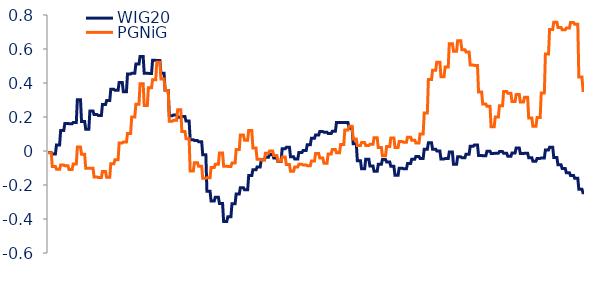
| Category | WIG20 | PGNiG |
|---|---|---|
| 2005-09-23 | -0.009 | -0.01 |
| 2005-09-26 | -0.009 | -0.01 |
| 2005-09-27 | -0.009 | -0.01 |
| 2005-09-28 | -0.009 | -0.01 |
| 2005-09-29 | -0.009 | -0.01 |
| 2005-09-30 | -0.009 | -0.01 |
| 2005-10-03 | -0.009 | -0.01 |
| 2005-10-04 | -0.009 | -0.01 |
| 2005-10-05 | -0.009 | -0.01 |
| 2005-10-06 | -0.009 | -0.01 |
| 2005-10-07 | -0.009 | -0.01 |
| 2005-10-10 | -0.009 | -0.01 |
| 2005-10-11 | -0.009 | -0.01 |
| 2005-10-12 | -0.009 | -0.01 |
| 2005-10-13 | -0.009 | -0.01 |
| 2005-10-14 | -0.009 | -0.01 |
| 2005-10-17 | -0.009 | -0.01 |
| 2005-10-18 | -0.009 | -0.01 |
| 2005-10-19 | -0.009 | -0.01 |
| 2005-10-20 | -0.009 | -0.01 |
| 2005-10-21 | -0.018 | -0.091 |
| 2005-10-24 | -0.018 | -0.091 |
| 2005-10-25 | -0.018 | -0.091 |
| 2005-10-26 | -0.018 | -0.091 |
| 2005-10-27 | -0.018 | -0.091 |
| 2005-10-28 | -0.018 | -0.091 |
| 2005-10-31 | -0.018 | -0.091 |
| 2005-11-02 | -0.018 | -0.091 |
| 2005-11-03 | -0.018 | -0.091 |
| 2005-11-04 | -0.018 | -0.091 |
| 2005-11-07 | -0.018 | -0.091 |
| 2005-11-08 | -0.018 | -0.091 |
| 2005-11-09 | -0.018 | -0.091 |
| 2005-11-10 | -0.018 | -0.091 |
| 2005-11-14 | -0.018 | -0.091 |
| 2005-11-15 | -0.018 | -0.091 |
| 2005-11-16 | -0.018 | -0.091 |
| 2005-11-17 | -0.018 | -0.091 |
| 2005-11-18 | -0.018 | -0.091 |
| 2005-11-21 | -0.018 | -0.091 |
| 2005-11-22 | 0.035 | -0.108 |
| 2005-11-23 | 0.035 | -0.108 |
| 2005-11-24 | 0.035 | -0.108 |
| 2005-11-25 | 0.035 | -0.108 |
| 2005-11-28 | 0.035 | -0.108 |
| 2005-11-29 | 0.035 | -0.108 |
| 2005-11-30 | 0.035 | -0.108 |
| 2005-12-01 | 0.035 | -0.108 |
| 2005-12-02 | 0.035 | -0.108 |
| 2005-12-05 | 0.035 | -0.108 |
| 2005-12-06 | 0.035 | -0.108 |
| 2005-12-07 | 0.035 | -0.108 |
| 2005-12-08 | 0.035 | -0.108 |
| 2005-12-09 | 0.035 | -0.108 |
| 2005-12-12 | 0.035 | -0.108 |
| 2005-12-13 | 0.035 | -0.108 |
| 2005-12-14 | 0.035 | -0.108 |
| 2005-12-15 | 0.035 | -0.108 |
| 2005-12-16 | 0.035 | -0.108 |
| 2005-12-19 | 0.035 | -0.108 |
| 2005-12-20 | 0.12 | -0.082 |
| 2005-12-21 | 0.12 | -0.082 |
| 2005-12-22 | 0.12 | -0.082 |
| 2005-12-23 | 0.12 | -0.082 |
| 2005-12-27 | 0.12 | -0.082 |
| 2005-12-28 | 0.12 | -0.082 |
| 2005-12-29 | 0.12 | -0.082 |
| 2005-12-30 | 0.12 | -0.082 |
| 2006-01-02 | 0.12 | -0.082 |
| 2006-01-03 | 0.12 | -0.082 |
| 2006-01-04 | 0.12 | -0.082 |
| 2006-01-05 | 0.12 | -0.082 |
| 2006-01-06 | 0.12 | -0.082 |
| 2006-01-09 | 0.12 | -0.082 |
| 2006-01-10 | 0.12 | -0.082 |
| 2006-01-11 | 0.12 | -0.082 |
| 2006-01-12 | 0.12 | -0.082 |
| 2006-01-13 | 0.12 | -0.082 |
| 2006-01-16 | 0.12 | -0.082 |
| 2006-01-17 | 0.12 | -0.082 |
| 2006-01-18 | 0.162 | -0.087 |
| 2006-01-19 | 0.162 | -0.087 |
| 2006-01-20 | 0.162 | -0.087 |
| 2006-01-23 | 0.162 | -0.087 |
| 2006-01-24 | 0.162 | -0.087 |
| 2006-01-25 | 0.162 | -0.087 |
| 2006-01-26 | 0.162 | -0.087 |
| 2006-01-27 | 0.162 | -0.087 |
| 2006-01-30 | 0.162 | -0.087 |
| 2006-01-31 | 0.162 | -0.087 |
| 2006-02-01 | 0.162 | -0.087 |
| 2006-02-02 | 0.162 | -0.087 |
| 2006-02-03 | 0.162 | -0.087 |
| 2006-02-06 | 0.162 | -0.087 |
| 2006-02-07 | 0.162 | -0.087 |
| 2006-02-08 | 0.162 | -0.087 |
| 2006-02-09 | 0.162 | -0.087 |
| 2006-02-10 | 0.162 | -0.087 |
| 2006-02-13 | 0.162 | -0.087 |
| 2006-02-14 | 0.162 | -0.087 |
| 2006-02-15 | 0.16 | -0.109 |
| 2006-02-16 | 0.16 | -0.109 |
| 2006-02-17 | 0.16 | -0.109 |
| 2006-02-20 | 0.16 | -0.109 |
| 2006-02-21 | 0.16 | -0.109 |
| 2006-02-22 | 0.16 | -0.109 |
| 2006-02-23 | 0.16 | -0.109 |
| 2006-02-24 | 0.16 | -0.109 |
| 2006-02-27 | 0.16 | -0.109 |
| 2006-02-28 | 0.16 | -0.109 |
| 2006-03-01 | 0.16 | -0.109 |
| 2006-03-02 | 0.16 | -0.109 |
| 2006-03-03 | 0.16 | -0.109 |
| 2006-03-06 | 0.16 | -0.109 |
| 2006-03-07 | 0.16 | -0.109 |
| 2006-03-08 | 0.16 | -0.109 |
| 2006-03-09 | 0.16 | -0.109 |
| 2006-03-10 | 0.16 | -0.109 |
| 2006-03-13 | 0.16 | -0.109 |
| 2006-03-14 | 0.16 | -0.109 |
| 2006-03-15 | 0.168 | -0.077 |
| 2006-03-16 | 0.168 | -0.077 |
| 2006-03-17 | 0.168 | -0.077 |
| 2006-03-20 | 0.168 | -0.077 |
| 2006-03-21 | 0.168 | -0.077 |
| 2006-03-22 | 0.168 | -0.077 |
| 2006-03-23 | 0.168 | -0.077 |
| 2006-03-24 | 0.168 | -0.077 |
| 2006-03-27 | 0.168 | -0.077 |
| 2006-03-28 | 0.168 | -0.077 |
| 2006-03-29 | 0.168 | -0.077 |
| 2006-03-30 | 0.168 | -0.077 |
| 2006-03-31 | 0.168 | -0.077 |
| 2006-04-03 | 0.168 | -0.077 |
| 2006-04-04 | 0.168 | -0.077 |
| 2006-04-05 | 0.168 | -0.077 |
| 2006-04-06 | 0.168 | -0.077 |
| 2006-04-07 | 0.168 | -0.077 |
| 2006-04-10 | 0.168 | -0.077 |
| 2006-04-11 | 0.168 | -0.077 |
| 2006-04-12 | 0.302 | 0.023 |
| 2006-04-13 | 0.302 | 0.023 |
| 2006-04-18 | 0.302 | 0.023 |
| 2006-04-19 | 0.302 | 0.023 |
| 2006-04-20 | 0.302 | 0.023 |
| 2006-04-21 | 0.302 | 0.023 |
| 2006-04-24 | 0.302 | 0.023 |
| 2006-04-25 | 0.302 | 0.023 |
| 2006-04-26 | 0.302 | 0.023 |
| 2006-04-27 | 0.302 | 0.023 |
| 2006-04-28 | 0.302 | 0.023 |
| 2006-05-02 | 0.302 | 0.023 |
| 2006-05-04 | 0.302 | 0.023 |
| 2006-05-05 | 0.302 | 0.023 |
| 2006-05-08 | 0.302 | 0.023 |
| 2006-05-09 | 0.302 | 0.023 |
| 2006-05-10 | 0.302 | 0.023 |
| 2006-05-11 | 0.302 | 0.023 |
| 2006-05-12 | 0.302 | 0.023 |
| 2006-05-15 | 0.302 | 0.023 |
| 2006-05-16 | 0.174 | -0.019 |
| 2006-05-17 | 0.174 | -0.019 |
| 2006-05-18 | 0.174 | -0.019 |
| 2006-05-19 | 0.174 | -0.019 |
| 2006-05-22 | 0.174 | -0.019 |
| 2006-05-23 | 0.174 | -0.019 |
| 2006-05-24 | 0.174 | -0.019 |
| 2006-05-25 | 0.174 | -0.019 |
| 2006-05-26 | 0.174 | -0.019 |
| 2006-05-29 | 0.174 | -0.019 |
| 2006-05-30 | 0.174 | -0.019 |
| 2006-05-31 | 0.174 | -0.019 |
| 2006-06-01 | 0.174 | -0.019 |
| 2006-06-02 | 0.174 | -0.019 |
| 2006-06-05 | 0.174 | -0.019 |
| 2006-06-06 | 0.174 | -0.019 |
| 2006-06-07 | 0.174 | -0.019 |
| 2006-06-08 | 0.174 | -0.019 |
| 2006-06-09 | 0.174 | -0.019 |
| 2006-06-12 | 0.174 | -0.019 |
| 2006-06-13 | 0.128 | -0.101 |
| 2006-06-14 | 0.128 | -0.101 |
| 2006-06-16 | 0.128 | -0.101 |
| 2006-06-19 | 0.128 | -0.101 |
| 2006-06-20 | 0.128 | -0.101 |
| 2006-06-21 | 0.128 | -0.101 |
| 2006-06-22 | 0.128 | -0.101 |
| 2006-06-23 | 0.128 | -0.101 |
| 2006-06-26 | 0.128 | -0.101 |
| 2006-06-27 | 0.128 | -0.101 |
| 2006-06-28 | 0.128 | -0.101 |
| 2006-06-29 | 0.128 | -0.101 |
| 2006-06-30 | 0.128 | -0.101 |
| 2006-07-03 | 0.128 | -0.101 |
| 2006-07-04 | 0.128 | -0.101 |
| 2006-07-05 | 0.128 | -0.101 |
| 2006-07-06 | 0.128 | -0.101 |
| 2006-07-07 | 0.128 | -0.101 |
| 2006-07-10 | 0.128 | -0.101 |
| 2006-07-11 | 0.128 | -0.101 |
| 2006-07-12 | 0.236 | -0.101 |
| 2006-07-13 | 0.236 | -0.101 |
| 2006-07-14 | 0.236 | -0.101 |
| 2006-07-17 | 0.236 | -0.101 |
| 2006-07-18 | 0.236 | -0.101 |
| 2006-07-19 | 0.236 | -0.101 |
| 2006-07-20 | 0.236 | -0.101 |
| 2006-07-21 | 0.236 | -0.101 |
| 2006-07-24 | 0.236 | -0.101 |
| 2006-07-25 | 0.236 | -0.101 |
| 2006-07-26 | 0.236 | -0.101 |
| 2006-07-27 | 0.236 | -0.101 |
| 2006-07-28 | 0.236 | -0.101 |
| 2006-07-31 | 0.236 | -0.101 |
| 2006-08-01 | 0.236 | -0.101 |
| 2006-08-02 | 0.236 | -0.101 |
| 2006-08-03 | 0.236 | -0.101 |
| 2006-08-04 | 0.236 | -0.101 |
| 2006-08-07 | 0.236 | -0.101 |
| 2006-08-08 | 0.236 | -0.101 |
| 2006-08-09 | 0.214 | -0.153 |
| 2006-08-10 | 0.214 | -0.153 |
| 2006-08-11 | 0.214 | -0.153 |
| 2006-08-14 | 0.214 | -0.153 |
| 2006-08-16 | 0.214 | -0.153 |
| 2006-08-17 | 0.214 | -0.153 |
| 2006-08-18 | 0.214 | -0.153 |
| 2006-08-21 | 0.214 | -0.153 |
| 2006-08-22 | 0.214 | -0.153 |
| 2006-08-23 | 0.214 | -0.153 |
| 2006-08-24 | 0.214 | -0.153 |
| 2006-08-25 | 0.214 | -0.153 |
| 2006-08-28 | 0.214 | -0.153 |
| 2006-08-29 | 0.214 | -0.153 |
| 2006-08-30 | 0.214 | -0.153 |
| 2006-08-31 | 0.214 | -0.153 |
| 2006-09-01 | 0.214 | -0.153 |
| 2006-09-04 | 0.214 | -0.153 |
| 2006-09-05 | 0.214 | -0.153 |
| 2006-09-06 | 0.214 | -0.153 |
| 2006-09-07 | 0.209 | -0.156 |
| 2006-09-08 | 0.209 | -0.156 |
| 2006-09-11 | 0.209 | -0.156 |
| 2006-09-12 | 0.209 | -0.156 |
| 2006-09-13 | 0.209 | -0.156 |
| 2006-09-14 | 0.209 | -0.156 |
| 2006-09-15 | 0.209 | -0.156 |
| 2006-09-18 | 0.209 | -0.156 |
| 2006-09-19 | 0.209 | -0.156 |
| 2006-09-20 | 0.209 | -0.156 |
| 2006-09-21 | 0.209 | -0.156 |
| 2006-09-22 | 0.209 | -0.156 |
| 2006-09-25 | 0.209 | -0.156 |
| 2006-09-26 | 0.209 | -0.156 |
| 2006-09-27 | 0.209 | -0.156 |
| 2006-09-28 | 0.209 | -0.156 |
| 2006-09-29 | 0.209 | -0.156 |
| 2006-10-02 | 0.209 | -0.156 |
| 2006-10-03 | 0.209 | -0.156 |
| 2006-10-04 | 0.209 | -0.156 |
| 2006-10-05 | 0.273 | -0.121 |
| 2006-10-06 | 0.273 | -0.121 |
| 2006-10-09 | 0.273 | -0.121 |
| 2006-10-10 | 0.273 | -0.121 |
| 2006-10-11 | 0.273 | -0.121 |
| 2006-10-12 | 0.273 | -0.121 |
| 2006-10-13 | 0.273 | -0.121 |
| 2006-10-16 | 0.273 | -0.121 |
| 2006-10-17 | 0.273 | -0.121 |
| 2006-10-18 | 0.273 | -0.121 |
| 2006-10-19 | 0.273 | -0.121 |
| 2006-10-20 | 0.273 | -0.121 |
| 2006-10-23 | 0.273 | -0.121 |
| 2006-10-24 | 0.273 | -0.121 |
| 2006-10-25 | 0.273 | -0.121 |
| 2006-10-26 | 0.273 | -0.121 |
| 2006-10-27 | 0.273 | -0.121 |
| 2006-10-30 | 0.273 | -0.121 |
| 2006-10-31 | 0.273 | -0.121 |
| 2006-11-02 | 0.273 | -0.121 |
| 2006-11-03 | 0.297 | -0.154 |
| 2006-11-06 | 0.297 | -0.154 |
| 2006-11-07 | 0.297 | -0.154 |
| 2006-11-08 | 0.297 | -0.154 |
| 2006-11-09 | 0.297 | -0.154 |
| 2006-11-10 | 0.297 | -0.154 |
| 2006-11-13 | 0.297 | -0.154 |
| 2006-11-14 | 0.297 | -0.154 |
| 2006-11-15 | 0.297 | -0.154 |
| 2006-11-16 | 0.297 | -0.154 |
| 2006-11-17 | 0.297 | -0.154 |
| 2006-11-20 | 0.297 | -0.154 |
| 2006-11-21 | 0.297 | -0.154 |
| 2006-11-22 | 0.297 | -0.154 |
| 2006-11-23 | 0.297 | -0.154 |
| 2006-11-24 | 0.297 | -0.154 |
| 2006-11-27 | 0.297 | -0.154 |
| 2006-11-28 | 0.297 | -0.154 |
| 2006-11-29 | 0.297 | -0.154 |
| 2006-11-30 | 0.297 | -0.154 |
| 2006-12-01 | 0.363 | -0.075 |
| 2006-12-04 | 0.363 | -0.075 |
| 2006-12-05 | 0.363 | -0.075 |
| 2006-12-06 | 0.363 | -0.075 |
| 2006-12-07 | 0.363 | -0.075 |
| 2006-12-08 | 0.363 | -0.075 |
| 2006-12-11 | 0.363 | -0.075 |
| 2006-12-12 | 0.363 | -0.075 |
| 2006-12-13 | 0.363 | -0.075 |
| 2006-12-14 | 0.363 | -0.075 |
| 2006-12-15 | 0.363 | -0.075 |
| 2006-12-18 | 0.363 | -0.075 |
| 2006-12-19 | 0.363 | -0.075 |
| 2006-12-20 | 0.363 | -0.075 |
| 2006-12-21 | 0.363 | -0.075 |
| 2006-12-22 | 0.363 | -0.075 |
| 2006-12-27 | 0.363 | -0.075 |
| 2006-12-28 | 0.363 | -0.075 |
| 2006-12-29 | 0.363 | -0.075 |
| 2007-01-02 | 0.363 | -0.075 |
| 2007-01-03 | 0.357 | -0.051 |
| 2007-01-04 | 0.357 | -0.051 |
| 2007-01-05 | 0.357 | -0.051 |
| 2007-01-08 | 0.357 | -0.051 |
| 2007-01-09 | 0.357 | -0.051 |
| 2007-01-10 | 0.357 | -0.051 |
| 2007-01-11 | 0.357 | -0.051 |
| 2007-01-12 | 0.357 | -0.051 |
| 2007-01-15 | 0.357 | -0.051 |
| 2007-01-16 | 0.357 | -0.051 |
| 2007-01-17 | 0.357 | -0.051 |
| 2007-01-18 | 0.357 | -0.051 |
| 2007-01-19 | 0.357 | -0.051 |
| 2007-01-22 | 0.357 | -0.051 |
| 2007-01-23 | 0.357 | -0.051 |
| 2007-01-24 | 0.357 | -0.051 |
| 2007-01-25 | 0.357 | -0.051 |
| 2007-01-26 | 0.357 | -0.051 |
| 2007-01-29 | 0.357 | -0.051 |
| 2007-01-30 | 0.357 | -0.051 |
| 2007-01-31 | 0.403 | 0.047 |
| 2007-02-01 | 0.403 | 0.047 |
| 2007-02-02 | 0.403 | 0.047 |
| 2007-02-05 | 0.403 | 0.047 |
| 2007-02-06 | 0.403 | 0.047 |
| 2007-02-07 | 0.403 | 0.047 |
| 2007-02-08 | 0.403 | 0.047 |
| 2007-02-09 | 0.403 | 0.047 |
| 2007-02-12 | 0.403 | 0.047 |
| 2007-02-13 | 0.403 | 0.047 |
| 2007-02-14 | 0.403 | 0.047 |
| 2007-02-15 | 0.403 | 0.047 |
| 2007-02-16 | 0.403 | 0.047 |
| 2007-02-19 | 0.403 | 0.047 |
| 2007-02-20 | 0.403 | 0.047 |
| 2007-02-21 | 0.403 | 0.047 |
| 2007-02-22 | 0.403 | 0.047 |
| 2007-02-23 | 0.403 | 0.047 |
| 2007-02-26 | 0.403 | 0.047 |
| 2007-02-27 | 0.403 | 0.047 |
| 2007-02-28 | 0.349 | 0.053 |
| 2007-03-01 | 0.349 | 0.053 |
| 2007-03-02 | 0.349 | 0.053 |
| 2007-03-05 | 0.349 | 0.053 |
| 2007-03-06 | 0.349 | 0.053 |
| 2007-03-07 | 0.349 | 0.053 |
| 2007-03-08 | 0.349 | 0.053 |
| 2007-03-09 | 0.349 | 0.053 |
| 2007-03-12 | 0.349 | 0.053 |
| 2007-03-13 | 0.349 | 0.053 |
| 2007-03-14 | 0.349 | 0.053 |
| 2007-03-15 | 0.349 | 0.053 |
| 2007-03-16 | 0.349 | 0.053 |
| 2007-03-19 | 0.349 | 0.053 |
| 2007-03-20 | 0.349 | 0.053 |
| 2007-03-21 | 0.349 | 0.053 |
| 2007-03-22 | 0.349 | 0.053 |
| 2007-03-23 | 0.349 | 0.053 |
| 2007-03-26 | 0.349 | 0.053 |
| 2007-03-27 | 0.349 | 0.053 |
| 2007-03-28 | 0.453 | 0.103 |
| 2007-03-29 | 0.453 | 0.103 |
| 2007-03-30 | 0.453 | 0.103 |
| 2007-04-02 | 0.453 | 0.103 |
| 2007-04-03 | 0.453 | 0.103 |
| 2007-04-04 | 0.453 | 0.103 |
| 2007-04-05 | 0.453 | 0.103 |
| 2007-04-10 | 0.453 | 0.103 |
| 2007-04-11 | 0.453 | 0.103 |
| 2007-04-12 | 0.453 | 0.103 |
| 2007-04-13 | 0.453 | 0.103 |
| 2007-04-16 | 0.453 | 0.103 |
| 2007-04-17 | 0.453 | 0.103 |
| 2007-04-18 | 0.453 | 0.103 |
| 2007-04-19 | 0.453 | 0.103 |
| 2007-04-20 | 0.453 | 0.103 |
| 2007-04-23 | 0.453 | 0.103 |
| 2007-04-24 | 0.453 | 0.103 |
| 2007-04-25 | 0.453 | 0.103 |
| 2007-04-26 | 0.453 | 0.103 |
| 2007-04-27 | 0.458 | 0.2 |
| 2007-04-30 | 0.458 | 0.2 |
| 2007-05-02 | 0.458 | 0.2 |
| 2007-05-04 | 0.458 | 0.2 |
| 2007-05-07 | 0.458 | 0.2 |
| 2007-05-08 | 0.458 | 0.2 |
| 2007-05-09 | 0.458 | 0.2 |
| 2007-05-10 | 0.458 | 0.2 |
| 2007-05-11 | 0.458 | 0.2 |
| 2007-05-14 | 0.458 | 0.2 |
| 2007-05-15 | 0.458 | 0.2 |
| 2007-05-16 | 0.458 | 0.2 |
| 2007-05-17 | 0.458 | 0.2 |
| 2007-05-18 | 0.458 | 0.2 |
| 2007-05-21 | 0.458 | 0.2 |
| 2007-05-22 | 0.458 | 0.2 |
| 2007-05-23 | 0.458 | 0.2 |
| 2007-05-24 | 0.458 | 0.2 |
| 2007-05-25 | 0.458 | 0.2 |
| 2007-05-28 | 0.458 | 0.2 |
| 2007-05-29 | 0.511 | 0.275 |
| 2007-05-30 | 0.511 | 0.275 |
| 2007-05-31 | 0.511 | 0.275 |
| 2007-06-01 | 0.511 | 0.275 |
| 2007-06-04 | 0.511 | 0.275 |
| 2007-06-05 | 0.511 | 0.275 |
| 2007-06-06 | 0.511 | 0.275 |
| 2007-06-08 | 0.511 | 0.275 |
| 2007-06-11 | 0.511 | 0.275 |
| 2007-06-12 | 0.511 | 0.275 |
| 2007-06-13 | 0.511 | 0.275 |
| 2007-06-14 | 0.511 | 0.275 |
| 2007-06-15 | 0.511 | 0.275 |
| 2007-06-18 | 0.511 | 0.275 |
| 2007-06-19 | 0.511 | 0.275 |
| 2007-06-20 | 0.511 | 0.275 |
| 2007-06-21 | 0.511 | 0.275 |
| 2007-06-22 | 0.511 | 0.275 |
| 2007-06-25 | 0.511 | 0.275 |
| 2007-06-26 | 0.511 | 0.275 |
| 2007-06-27 | 0.556 | 0.395 |
| 2007-06-28 | 0.556 | 0.395 |
| 2007-06-29 | 0.556 | 0.395 |
| 2007-07-02 | 0.556 | 0.395 |
| 2007-07-03 | 0.556 | 0.395 |
| 2007-07-04 | 0.556 | 0.395 |
| 2007-07-05 | 0.556 | 0.395 |
| 2007-07-06 | 0.556 | 0.395 |
| 2007-07-09 | 0.556 | 0.395 |
| 2007-07-10 | 0.556 | 0.395 |
| 2007-07-11 | 0.556 | 0.395 |
| 2007-07-12 | 0.556 | 0.395 |
| 2007-07-13 | 0.556 | 0.395 |
| 2007-07-16 | 0.556 | 0.395 |
| 2007-07-17 | 0.556 | 0.395 |
| 2007-07-18 | 0.556 | 0.395 |
| 2007-07-19 | 0.556 | 0.395 |
| 2007-07-20 | 0.556 | 0.395 |
| 2007-07-23 | 0.556 | 0.395 |
| 2007-07-24 | 0.556 | 0.395 |
| 2007-07-25 | 0.457 | 0.267 |
| 2007-07-26 | 0.457 | 0.267 |
| 2007-07-27 | 0.457 | 0.267 |
| 2007-07-30 | 0.457 | 0.267 |
| 2007-07-31 | 0.457 | 0.267 |
| 2007-08-01 | 0.457 | 0.267 |
| 2007-08-02 | 0.457 | 0.267 |
| 2007-08-03 | 0.457 | 0.267 |
| 2007-08-06 | 0.457 | 0.267 |
| 2007-08-07 | 0.457 | 0.267 |
| 2007-08-08 | 0.457 | 0.267 |
| 2007-08-09 | 0.457 | 0.267 |
| 2007-08-10 | 0.457 | 0.267 |
| 2007-08-13 | 0.457 | 0.267 |
| 2007-08-14 | 0.457 | 0.267 |
| 2007-08-16 | 0.457 | 0.267 |
| 2007-08-17 | 0.457 | 0.267 |
| 2007-08-20 | 0.457 | 0.267 |
| 2007-08-21 | 0.457 | 0.267 |
| 2007-08-22 | 0.457 | 0.267 |
| 2007-08-23 | 0.457 | 0.372 |
| 2007-08-24 | 0.457 | 0.372 |
| 2007-08-27 | 0.457 | 0.372 |
| 2007-08-28 | 0.457 | 0.372 |
| 2007-08-29 | 0.457 | 0.372 |
| 2007-08-30 | 0.457 | 0.372 |
| 2007-08-31 | 0.457 | 0.372 |
| 2007-09-03 | 0.457 | 0.372 |
| 2007-09-04 | 0.457 | 0.372 |
| 2007-09-05 | 0.457 | 0.372 |
| 2007-09-06 | 0.457 | 0.372 |
| 2007-09-07 | 0.457 | 0.372 |
| 2007-09-10 | 0.457 | 0.372 |
| 2007-09-11 | 0.457 | 0.372 |
| 2007-09-12 | 0.457 | 0.372 |
| 2007-09-13 | 0.457 | 0.372 |
| 2007-09-14 | 0.457 | 0.372 |
| 2007-09-17 | 0.457 | 0.372 |
| 2007-09-18 | 0.457 | 0.372 |
| 2007-09-19 | 0.457 | 0.372 |
| 2007-09-20 | 0.534 | 0.419 |
| 2007-09-21 | 0.534 | 0.419 |
| 2007-09-24 | 0.534 | 0.419 |
| 2007-09-25 | 0.534 | 0.419 |
| 2007-09-26 | 0.534 | 0.419 |
| 2007-09-27 | 0.534 | 0.419 |
| 2007-09-28 | 0.534 | 0.419 |
| 2007-10-01 | 0.534 | 0.419 |
| 2007-10-02 | 0.534 | 0.419 |
| 2007-10-03 | 0.534 | 0.419 |
| 2007-10-04 | 0.534 | 0.419 |
| 2007-10-05 | 0.534 | 0.419 |
| 2007-10-08 | 0.534 | 0.419 |
| 2007-10-09 | 0.534 | 0.419 |
| 2007-10-10 | 0.534 | 0.419 |
| 2007-10-11 | 0.534 | 0.419 |
| 2007-10-12 | 0.534 | 0.419 |
| 2007-10-15 | 0.534 | 0.419 |
| 2007-10-16 | 0.534 | 0.419 |
| 2007-10-17 | 0.534 | 0.419 |
| 2007-10-18 | 0.532 | 0.521 |
| 2007-10-19 | 0.532 | 0.521 |
| 2007-10-22 | 0.532 | 0.521 |
| 2007-10-23 | 0.532 | 0.521 |
| 2007-10-24 | 0.532 | 0.521 |
| 2007-10-25 | 0.532 | 0.521 |
| 2007-10-26 | 0.532 | 0.521 |
| 2007-10-29 | 0.532 | 0.521 |
| 2007-10-30 | 0.532 | 0.521 |
| 2007-10-31 | 0.532 | 0.521 |
| 2007-11-02 | 0.532 | 0.521 |
| 2007-11-05 | 0.532 | 0.521 |
| 2007-11-06 | 0.532 | 0.521 |
| 2007-11-07 | 0.532 | 0.521 |
| 2007-11-08 | 0.532 | 0.521 |
| 2007-11-09 | 0.532 | 0.521 |
| 2007-11-12 | 0.532 | 0.521 |
| 2007-11-13 | 0.532 | 0.521 |
| 2007-11-14 | 0.532 | 0.521 |
| 2007-11-15 | 0.532 | 0.521 |
| 2007-11-16 | 0.457 | 0.424 |
| 2007-11-19 | 0.457 | 0.424 |
| 2007-11-20 | 0.457 | 0.424 |
| 2007-11-21 | 0.457 | 0.424 |
| 2007-11-22 | 0.457 | 0.424 |
| 2007-11-23 | 0.457 | 0.424 |
| 2007-11-26 | 0.457 | 0.424 |
| 2007-11-27 | 0.457 | 0.424 |
| 2007-11-28 | 0.457 | 0.424 |
| 2007-11-29 | 0.457 | 0.424 |
| 2007-11-30 | 0.457 | 0.424 |
| 2007-12-03 | 0.457 | 0.424 |
| 2007-12-04 | 0.457 | 0.424 |
| 2007-12-05 | 0.457 | 0.424 |
| 2007-12-06 | 0.457 | 0.424 |
| 2007-12-07 | 0.457 | 0.424 |
| 2007-12-10 | 0.457 | 0.424 |
| 2007-12-11 | 0.457 | 0.424 |
| 2007-12-12 | 0.457 | 0.424 |
| 2007-12-13 | 0.457 | 0.424 |
| 2007-12-14 | 0.357 | 0.355 |
| 2007-12-17 | 0.357 | 0.355 |
| 2007-12-18 | 0.357 | 0.355 |
| 2007-12-19 | 0.357 | 0.355 |
| 2007-12-20 | 0.357 | 0.355 |
| 2007-12-21 | 0.357 | 0.355 |
| 2007-12-27 | 0.357 | 0.355 |
| 2007-12-28 | 0.357 | 0.355 |
| 2008-01-02 | 0.357 | 0.355 |
| 2008-01-03 | 0.357 | 0.355 |
| 2008-01-04 | 0.357 | 0.355 |
| 2008-01-07 | 0.357 | 0.355 |
| 2008-01-08 | 0.357 | 0.355 |
| 2008-01-09 | 0.357 | 0.355 |
| 2008-01-10 | 0.357 | 0.355 |
| 2008-01-11 | 0.357 | 0.355 |
| 2008-01-14 | 0.357 | 0.355 |
| 2008-01-15 | 0.357 | 0.355 |
| 2008-01-16 | 0.357 | 0.355 |
| 2008-01-17 | 0.357 | 0.355 |
| 2008-01-18 | 0.208 | 0.175 |
| 2008-01-21 | 0.208 | 0.175 |
| 2008-01-22 | 0.208 | 0.175 |
| 2008-01-23 | 0.208 | 0.175 |
| 2008-01-24 | 0.208 | 0.175 |
| 2008-01-25 | 0.208 | 0.175 |
| 2008-01-28 | 0.208 | 0.175 |
| 2008-01-29 | 0.208 | 0.175 |
| 2008-01-30 | 0.208 | 0.175 |
| 2008-01-31 | 0.208 | 0.175 |
| 2008-02-01 | 0.208 | 0.175 |
| 2008-02-04 | 0.208 | 0.175 |
| 2008-02-05 | 0.208 | 0.175 |
| 2008-02-06 | 0.208 | 0.175 |
| 2008-02-07 | 0.208 | 0.175 |
| 2008-02-08 | 0.208 | 0.175 |
| 2008-02-11 | 0.208 | 0.175 |
| 2008-02-12 | 0.208 | 0.175 |
| 2008-02-13 | 0.208 | 0.175 |
| 2008-02-14 | 0.208 | 0.175 |
| 2008-02-15 | 0.212 | 0.181 |
| 2008-02-18 | 0.212 | 0.181 |
| 2008-02-19 | 0.212 | 0.181 |
| 2008-02-20 | 0.212 | 0.181 |
| 2008-02-21 | 0.212 | 0.181 |
| 2008-02-22 | 0.212 | 0.181 |
| 2008-02-25 | 0.212 | 0.181 |
| 2008-02-26 | 0.212 | 0.181 |
| 2008-02-27 | 0.212 | 0.181 |
| 2008-02-28 | 0.212 | 0.181 |
| 2008-02-29 | 0.212 | 0.181 |
| 2008-03-03 | 0.212 | 0.181 |
| 2008-03-04 | 0.212 | 0.181 |
| 2008-03-05 | 0.212 | 0.181 |
| 2008-03-06 | 0.212 | 0.181 |
| 2008-03-07 | 0.212 | 0.181 |
| 2008-03-10 | 0.212 | 0.181 |
| 2008-03-11 | 0.212 | 0.181 |
| 2008-03-12 | 0.212 | 0.181 |
| 2008-03-13 | 0.212 | 0.181 |
| 2008-03-14 | 0.198 | 0.242 |
| 2008-03-17 | 0.198 | 0.242 |
| 2008-03-18 | 0.198 | 0.242 |
| 2008-03-19 | 0.198 | 0.242 |
| 2008-03-20 | 0.198 | 0.242 |
| 2008-03-25 | 0.198 | 0.242 |
| 2008-03-26 | 0.198 | 0.242 |
| 2008-03-27 | 0.198 | 0.242 |
| 2008-03-28 | 0.198 | 0.242 |
| 2008-03-31 | 0.198 | 0.242 |
| 2008-04-01 | 0.198 | 0.242 |
| 2008-04-02 | 0.198 | 0.242 |
| 2008-04-03 | 0.198 | 0.242 |
| 2008-04-04 | 0.198 | 0.242 |
| 2008-04-07 | 0.198 | 0.242 |
| 2008-04-08 | 0.198 | 0.242 |
| 2008-04-09 | 0.198 | 0.242 |
| 2008-04-10 | 0.198 | 0.242 |
| 2008-04-11 | 0.198 | 0.242 |
| 2008-04-14 | 0.198 | 0.242 |
| 2008-04-15 | 0.202 | 0.115 |
| 2008-04-16 | 0.202 | 0.115 |
| 2008-04-17 | 0.202 | 0.115 |
| 2008-04-18 | 0.202 | 0.115 |
| 2008-04-21 | 0.202 | 0.115 |
| 2008-04-22 | 0.202 | 0.115 |
| 2008-04-23 | 0.202 | 0.115 |
| 2008-04-24 | 0.202 | 0.115 |
| 2008-04-25 | 0.202 | 0.115 |
| 2008-04-28 | 0.202 | 0.115 |
| 2008-04-29 | 0.202 | 0.115 |
| 2008-04-30 | 0.202 | 0.115 |
| 2008-05-05 | 0.202 | 0.115 |
| 2008-05-06 | 0.202 | 0.115 |
| 2008-05-07 | 0.202 | 0.115 |
| 2008-05-08 | 0.202 | 0.115 |
| 2008-05-09 | 0.202 | 0.115 |
| 2008-05-12 | 0.202 | 0.115 |
| 2008-05-13 | 0.202 | 0.115 |
| 2008-05-14 | 0.202 | 0.115 |
| 2008-05-15 | 0.176 | 0.073 |
| 2008-05-16 | 0.176 | 0.073 |
| 2008-05-19 | 0.176 | 0.073 |
| 2008-05-20 | 0.176 | 0.073 |
| 2008-05-21 | 0.176 | 0.073 |
| 2008-05-23 | 0.176 | 0.073 |
| 2008-05-26 | 0.176 | 0.073 |
| 2008-05-27 | 0.176 | 0.073 |
| 2008-05-28 | 0.176 | 0.073 |
| 2008-05-29 | 0.176 | 0.073 |
| 2008-05-30 | 0.176 | 0.073 |
| 2008-06-02 | 0.176 | 0.073 |
| 2008-06-03 | 0.176 | 0.073 |
| 2008-06-04 | 0.176 | 0.073 |
| 2008-06-05 | 0.176 | 0.073 |
| 2008-06-06 | 0.176 | 0.073 |
| 2008-06-09 | 0.176 | 0.073 |
| 2008-06-10 | 0.176 | 0.073 |
| 2008-06-11 | 0.176 | 0.073 |
| 2008-06-12 | 0.176 | 0.073 |
| 2008-06-13 | 0.067 | -0.118 |
| 2008-06-16 | 0.067 | -0.118 |
| 2008-06-17 | 0.067 | -0.118 |
| 2008-06-18 | 0.067 | -0.118 |
| 2008-06-19 | 0.067 | -0.118 |
| 2008-06-20 | 0.067 | -0.118 |
| 2008-06-23 | 0.067 | -0.118 |
| 2008-06-24 | 0.067 | -0.118 |
| 2008-06-25 | 0.067 | -0.118 |
| 2008-06-26 | 0.067 | -0.118 |
| 2008-06-27 | 0.067 | -0.118 |
| 2008-06-30 | 0.067 | -0.118 |
| 2008-07-01 | 0.067 | -0.118 |
| 2008-07-02 | 0.067 | -0.118 |
| 2008-07-03 | 0.067 | -0.118 |
| 2008-07-04 | 0.067 | -0.118 |
| 2008-07-07 | 0.067 | -0.118 |
| 2008-07-08 | 0.067 | -0.118 |
| 2008-07-09 | 0.067 | -0.118 |
| 2008-07-10 | 0.067 | -0.118 |
| 2008-07-11 | 0.062 | -0.069 |
| 2008-07-14 | 0.062 | -0.069 |
| 2008-07-15 | 0.062 | -0.069 |
| 2008-07-16 | 0.062 | -0.069 |
| 2008-07-17 | 0.062 | -0.069 |
| 2008-07-18 | 0.062 | -0.069 |
| 2008-07-21 | 0.062 | -0.069 |
| 2008-07-22 | 0.062 | -0.069 |
| 2008-07-23 | 0.062 | -0.069 |
| 2008-07-24 | 0.062 | -0.069 |
| 2008-07-25 | 0.062 | -0.069 |
| 2008-07-28 | 0.062 | -0.069 |
| 2008-07-29 | 0.062 | -0.069 |
| 2008-07-30 | 0.062 | -0.069 |
| 2008-07-31 | 0.062 | -0.069 |
| 2008-08-01 | 0.062 | -0.069 |
| 2008-08-04 | 0.062 | -0.069 |
| 2008-08-05 | 0.062 | -0.069 |
| 2008-08-06 | 0.062 | -0.069 |
| 2008-08-07 | 0.062 | -0.069 |
| 2008-08-08 | 0.054 | -0.09 |
| 2008-08-11 | 0.054 | -0.09 |
| 2008-08-12 | 0.054 | -0.09 |
| 2008-08-13 | 0.054 | -0.09 |
| 2008-08-14 | 0.054 | -0.09 |
| 2008-08-18 | 0.054 | -0.09 |
| 2008-08-19 | 0.054 | -0.09 |
| 2008-08-20 | 0.054 | -0.09 |
| 2008-08-21 | 0.054 | -0.09 |
| 2008-08-22 | 0.054 | -0.09 |
| 2008-08-25 | 0.054 | -0.09 |
| 2008-08-26 | 0.054 | -0.09 |
| 2008-08-27 | 0.054 | -0.09 |
| 2008-08-28 | 0.054 | -0.09 |
| 2008-08-29 | 0.054 | -0.09 |
| 2008-09-01 | 0.054 | -0.09 |
| 2008-09-02 | 0.054 | -0.09 |
| 2008-09-03 | 0.054 | -0.09 |
| 2008-09-04 | 0.054 | -0.09 |
| 2008-09-05 | 0.054 | -0.09 |
| 2008-09-08 | -0.022 | -0.16 |
| 2008-09-09 | -0.022 | -0.16 |
| 2008-09-10 | -0.022 | -0.16 |
| 2008-09-11 | -0.022 | -0.16 |
| 2008-09-12 | -0.022 | -0.16 |
| 2008-09-15 | -0.022 | -0.16 |
| 2008-09-16 | -0.022 | -0.16 |
| 2008-09-17 | -0.022 | -0.16 |
| 2008-09-18 | -0.022 | -0.16 |
| 2008-09-19 | -0.022 | -0.16 |
| 2008-09-22 | -0.022 | -0.16 |
| 2008-09-23 | -0.022 | -0.16 |
| 2008-09-24 | -0.022 | -0.16 |
| 2008-09-25 | -0.022 | -0.16 |
| 2008-09-26 | -0.022 | -0.16 |
| 2008-09-29 | -0.022 | -0.16 |
| 2008-09-30 | -0.022 | -0.16 |
| 2008-10-01 | -0.022 | -0.16 |
| 2008-10-02 | -0.022 | -0.16 |
| 2008-10-03 | -0.022 | -0.16 |
| 2008-10-06 | -0.237 | -0.158 |
| 2008-10-07 | -0.237 | -0.158 |
| 2008-10-08 | -0.237 | -0.158 |
| 2008-10-09 | -0.237 | -0.158 |
| 2008-10-10 | -0.237 | -0.158 |
| 2008-10-13 | -0.237 | -0.158 |
| 2008-10-14 | -0.237 | -0.158 |
| 2008-10-15 | -0.237 | -0.158 |
| 2008-10-16 | -0.237 | -0.158 |
| 2008-10-17 | -0.237 | -0.158 |
| 2008-10-20 | -0.237 | -0.158 |
| 2008-10-21 | -0.237 | -0.158 |
| 2008-10-22 | -0.237 | -0.158 |
| 2008-10-23 | -0.237 | -0.158 |
| 2008-10-24 | -0.237 | -0.158 |
| 2008-10-27 | -0.237 | -0.158 |
| 2008-10-28 | -0.237 | -0.158 |
| 2008-10-29 | -0.237 | -0.158 |
| 2008-10-30 | -0.237 | -0.158 |
| 2008-10-31 | -0.237 | -0.158 |
| 2008-11-03 | -0.294 | -0.096 |
| 2008-11-04 | -0.294 | -0.096 |
| 2008-11-05 | -0.294 | -0.096 |
| 2008-11-06 | -0.294 | -0.096 |
| 2008-11-07 | -0.294 | -0.096 |
| 2008-11-10 | -0.294 | -0.096 |
| 2008-11-12 | -0.294 | -0.096 |
| 2008-11-13 | -0.294 | -0.096 |
| 2008-11-14 | -0.294 | -0.096 |
| 2008-11-17 | -0.294 | -0.096 |
| 2008-11-18 | -0.294 | -0.096 |
| 2008-11-19 | -0.294 | -0.096 |
| 2008-11-20 | -0.294 | -0.096 |
| 2008-11-21 | -0.294 | -0.096 |
| 2008-11-24 | -0.294 | -0.096 |
| 2008-11-25 | -0.294 | -0.096 |
| 2008-11-26 | -0.294 | -0.096 |
| 2008-11-27 | -0.294 | -0.096 |
| 2008-11-28 | -0.294 | -0.096 |
| 2008-12-01 | -0.294 | -0.096 |
| 2008-12-02 | -0.272 | -0.078 |
| 2008-12-03 | -0.272 | -0.078 |
| 2008-12-04 | -0.272 | -0.078 |
| 2008-12-05 | -0.272 | -0.078 |
| 2008-12-08 | -0.272 | -0.078 |
| 2008-12-09 | -0.272 | -0.078 |
| 2008-12-10 | -0.272 | -0.078 |
| 2008-12-11 | -0.272 | -0.078 |
| 2008-12-12 | -0.272 | -0.078 |
| 2008-12-15 | -0.272 | -0.078 |
| 2008-12-16 | -0.272 | -0.078 |
| 2008-12-17 | -0.272 | -0.078 |
| 2008-12-18 | -0.272 | -0.078 |
| 2008-12-19 | -0.272 | -0.078 |
| 2008-12-22 | -0.272 | -0.078 |
| 2008-12-23 | -0.272 | -0.078 |
| 2008-12-29 | -0.272 | -0.078 |
| 2008-12-30 | -0.272 | -0.078 |
| 2008-12-31 | -0.272 | -0.078 |
| 2009-01-05 | -0.272 | -0.078 |
| 2009-01-06 | -0.308 | -0.011 |
| 2009-01-07 | -0.308 | -0.011 |
| 2009-01-08 | -0.308 | -0.011 |
| 2009-01-09 | -0.308 | -0.011 |
| 2009-01-12 | -0.308 | -0.011 |
| 2009-01-13 | -0.308 | -0.011 |
| 2009-01-14 | -0.308 | -0.011 |
| 2009-01-15 | -0.308 | -0.011 |
| 2009-01-16 | -0.308 | -0.011 |
| 2009-01-19 | -0.308 | -0.011 |
| 2009-01-20 | -0.308 | -0.011 |
| 2009-01-21 | -0.308 | -0.011 |
| 2009-01-22 | -0.308 | -0.011 |
| 2009-01-23 | -0.308 | -0.011 |
| 2009-01-26 | -0.308 | -0.011 |
| 2009-01-27 | -0.308 | -0.011 |
| 2009-01-28 | -0.308 | -0.011 |
| 2009-01-29 | -0.308 | -0.011 |
| 2009-01-30 | -0.308 | -0.011 |
| 2009-02-02 | -0.308 | -0.011 |
| 2009-02-03 | -0.415 | -0.089 |
| 2009-02-04 | -0.415 | -0.089 |
| 2009-02-05 | -0.415 | -0.089 |
| 2009-02-06 | -0.415 | -0.089 |
| 2009-02-09 | -0.415 | -0.089 |
| 2009-02-10 | -0.415 | -0.089 |
| 2009-02-11 | -0.415 | -0.089 |
| 2009-02-12 | -0.415 | -0.089 |
| 2009-02-13 | -0.415 | -0.089 |
| 2009-02-16 | -0.415 | -0.089 |
| 2009-02-17 | -0.415 | -0.089 |
| 2009-02-18 | -0.415 | -0.089 |
| 2009-02-19 | -0.415 | -0.089 |
| 2009-02-20 | -0.415 | -0.089 |
| 2009-02-23 | -0.415 | -0.089 |
| 2009-02-24 | -0.415 | -0.089 |
| 2009-02-25 | -0.415 | -0.089 |
| 2009-02-26 | -0.415 | -0.089 |
| 2009-02-27 | -0.415 | -0.089 |
| 2009-03-02 | -0.415 | -0.089 |
| 2009-03-03 | -0.387 | -0.091 |
| 2009-03-04 | -0.387 | -0.091 |
| 2009-03-05 | -0.387 | -0.091 |
| 2009-03-06 | -0.387 | -0.091 |
| 2009-03-09 | -0.387 | -0.091 |
| 2009-03-10 | -0.387 | -0.091 |
| 2009-03-11 | -0.387 | -0.091 |
| 2009-03-12 | -0.387 | -0.091 |
| 2009-03-13 | -0.387 | -0.091 |
| 2009-03-16 | -0.387 | -0.091 |
| 2009-03-17 | -0.387 | -0.091 |
| 2009-03-18 | -0.387 | -0.091 |
| 2009-03-19 | -0.387 | -0.091 |
| 2009-03-20 | -0.387 | -0.091 |
| 2009-03-23 | -0.387 | -0.091 |
| 2009-03-24 | -0.387 | -0.091 |
| 2009-03-25 | -0.387 | -0.091 |
| 2009-03-26 | -0.387 | -0.091 |
| 2009-03-27 | -0.387 | -0.091 |
| 2009-03-30 | -0.387 | -0.091 |
| 2009-03-31 | -0.31 | -0.071 |
| 2009-04-01 | -0.31 | -0.071 |
| 2009-04-02 | -0.31 | -0.071 |
| 2009-04-03 | -0.31 | -0.071 |
| 2009-04-06 | -0.31 | -0.071 |
| 2009-04-07 | -0.31 | -0.071 |
| 2009-04-08 | -0.31 | -0.071 |
| 2009-04-09 | -0.31 | -0.071 |
| 2009-04-14 | -0.31 | -0.071 |
| 2009-04-15 | -0.31 | -0.071 |
| 2009-04-16 | -0.31 | -0.071 |
| 2009-04-17 | -0.31 | -0.071 |
| 2009-04-20 | -0.31 | -0.071 |
| 2009-04-21 | -0.31 | -0.071 |
| 2009-04-22 | -0.31 | -0.071 |
| 2009-04-23 | -0.31 | -0.071 |
| 2009-04-24 | -0.31 | -0.071 |
| 2009-04-27 | -0.31 | -0.071 |
| 2009-04-28 | -0.31 | -0.071 |
| 2009-04-29 | -0.31 | -0.071 |
| 2009-04-30 | -0.253 | 0.009 |
| 2009-05-04 | -0.253 | 0.009 |
| 2009-05-05 | -0.253 | 0.009 |
| 2009-05-06 | -0.253 | 0.009 |
| 2009-05-07 | -0.253 | 0.009 |
| 2009-05-08 | -0.253 | 0.009 |
| 2009-05-11 | -0.253 | 0.009 |
| 2009-05-12 | -0.253 | 0.009 |
| 2009-05-13 | -0.253 | 0.009 |
| 2009-05-14 | -0.253 | 0.009 |
| 2009-05-15 | -0.253 | 0.009 |
| 2009-05-18 | -0.253 | 0.009 |
| 2009-05-19 | -0.253 | 0.009 |
| 2009-05-20 | -0.253 | 0.009 |
| 2009-05-21 | -0.253 | 0.009 |
| 2009-05-22 | -0.253 | 0.009 |
| 2009-05-25 | -0.253 | 0.009 |
| 2009-05-26 | -0.253 | 0.009 |
| 2009-05-27 | -0.253 | 0.009 |
| 2009-05-28 | -0.253 | 0.009 |
| 2009-05-29 | -0.216 | 0.094 |
| 2009-06-01 | -0.216 | 0.094 |
| 2009-06-02 | -0.216 | 0.094 |
| 2009-06-03 | -0.216 | 0.094 |
| 2009-06-04 | -0.216 | 0.094 |
| 2009-06-05 | -0.216 | 0.094 |
| 2009-06-08 | -0.216 | 0.094 |
| 2009-06-09 | -0.216 | 0.094 |
| 2009-06-10 | -0.216 | 0.094 |
| 2009-06-12 | -0.216 | 0.094 |
| 2009-06-15 | -0.216 | 0.094 |
| 2009-06-16 | -0.216 | 0.094 |
| 2009-06-17 | -0.216 | 0.094 |
| 2009-06-18 | -0.216 | 0.094 |
| 2009-06-19 | -0.216 | 0.094 |
| 2009-06-22 | -0.216 | 0.094 |
| 2009-06-23 | -0.216 | 0.094 |
| 2009-06-24 | -0.216 | 0.094 |
| 2009-06-25 | -0.216 | 0.094 |
| 2009-06-26 | -0.216 | 0.094 |
| 2009-06-29 | -0.229 | 0.064 |
| 2009-06-30 | -0.229 | 0.064 |
| 2009-07-01 | -0.229 | 0.064 |
| 2009-07-02 | -0.229 | 0.064 |
| 2009-07-03 | -0.229 | 0.064 |
| 2009-07-06 | -0.229 | 0.064 |
| 2009-07-07 | -0.229 | 0.064 |
| 2009-07-08 | -0.229 | 0.064 |
| 2009-07-09 | -0.229 | 0.064 |
| 2009-07-10 | -0.229 | 0.064 |
| 2009-07-13 | -0.229 | 0.064 |
| 2009-07-14 | -0.229 | 0.064 |
| 2009-07-15 | -0.229 | 0.064 |
| 2009-07-16 | -0.229 | 0.064 |
| 2009-07-17 | -0.229 | 0.064 |
| 2009-07-20 | -0.229 | 0.064 |
| 2009-07-21 | -0.229 | 0.064 |
| 2009-07-22 | -0.229 | 0.064 |
| 2009-07-23 | -0.229 | 0.064 |
| 2009-07-24 | -0.229 | 0.064 |
| 2009-07-27 | -0.145 | 0.121 |
| 2009-07-28 | -0.145 | 0.121 |
| 2009-07-29 | -0.145 | 0.121 |
| 2009-07-30 | -0.145 | 0.121 |
| 2009-07-31 | -0.145 | 0.121 |
| 2009-08-03 | -0.145 | 0.121 |
| 2009-08-04 | -0.145 | 0.121 |
| 2009-08-05 | -0.145 | 0.121 |
| 2009-08-06 | -0.145 | 0.121 |
| 2009-08-07 | -0.145 | 0.121 |
| 2009-08-10 | -0.145 | 0.121 |
| 2009-08-11 | -0.145 | 0.121 |
| 2009-08-12 | -0.145 | 0.121 |
| 2009-08-13 | -0.145 | 0.121 |
| 2009-08-14 | -0.145 | 0.121 |
| 2009-08-17 | -0.145 | 0.121 |
| 2009-08-18 | -0.145 | 0.121 |
| 2009-08-19 | -0.145 | 0.121 |
| 2009-08-20 | -0.145 | 0.121 |
| 2009-08-21 | -0.145 | 0.121 |
| 2009-08-24 | -0.111 | 0.018 |
| 2009-08-25 | -0.111 | 0.018 |
| 2009-08-26 | -0.111 | 0.018 |
| 2009-08-27 | -0.111 | 0.018 |
| 2009-08-28 | -0.111 | 0.018 |
| 2009-08-31 | -0.111 | 0.018 |
| 2009-09-01 | -0.111 | 0.018 |
| 2009-09-02 | -0.111 | 0.018 |
| 2009-09-03 | -0.111 | 0.018 |
| 2009-09-04 | -0.111 | 0.018 |
| 2009-09-07 | -0.111 | 0.018 |
| 2009-09-08 | -0.111 | 0.018 |
| 2009-09-09 | -0.111 | 0.018 |
| 2009-09-10 | -0.111 | 0.018 |
| 2009-09-11 | -0.111 | 0.018 |
| 2009-09-14 | -0.111 | 0.018 |
| 2009-09-15 | -0.111 | 0.018 |
| 2009-09-16 | -0.111 | 0.018 |
| 2009-09-17 | -0.111 | 0.018 |
| 2009-09-18 | -0.111 | 0.018 |
| 2009-09-21 | -0.094 | -0.049 |
| 2009-09-22 | -0.094 | -0.049 |
| 2009-09-23 | -0.094 | -0.049 |
| 2009-09-24 | -0.094 | -0.049 |
| 2009-09-25 | -0.094 | -0.049 |
| 2009-09-28 | -0.094 | -0.049 |
| 2009-09-29 | -0.094 | -0.049 |
| 2009-09-30 | -0.094 | -0.049 |
| 2009-10-01 | -0.094 | -0.049 |
| 2009-10-02 | -0.094 | -0.049 |
| 2009-10-05 | -0.094 | -0.049 |
| 2009-10-06 | -0.094 | -0.049 |
| 2009-10-07 | -0.094 | -0.049 |
| 2009-10-08 | -0.094 | -0.049 |
| 2009-10-09 | -0.094 | -0.049 |
| 2009-10-12 | -0.094 | -0.049 |
| 2009-10-13 | -0.094 | -0.049 |
| 2009-10-14 | -0.094 | -0.049 |
| 2009-10-15 | -0.094 | -0.049 |
| 2009-10-16 | -0.094 | -0.049 |
| 2009-10-19 | -0.052 | -0.053 |
| 2009-10-20 | -0.052 | -0.053 |
| 2009-10-21 | -0.052 | -0.053 |
| 2009-10-22 | -0.052 | -0.053 |
| 2009-10-23 | -0.052 | -0.053 |
| 2009-10-26 | -0.052 | -0.053 |
| 2009-10-27 | -0.052 | -0.053 |
| 2009-10-28 | -0.052 | -0.053 |
| 2009-10-29 | -0.052 | -0.053 |
| 2009-10-30 | -0.052 | -0.053 |
| 2009-11-02 | -0.052 | -0.053 |
| 2009-11-03 | -0.052 | -0.053 |
| 2009-11-04 | -0.052 | -0.053 |
| 2009-11-05 | -0.052 | -0.053 |
| 2009-11-06 | -0.052 | -0.053 |
| 2009-11-09 | -0.052 | -0.053 |
| 2009-11-10 | -0.052 | -0.053 |
| 2009-11-12 | -0.052 | -0.053 |
| 2009-11-13 | -0.052 | -0.053 |
| 2009-11-16 | -0.052 | -0.053 |
| 2009-11-17 | -0.036 | -0.014 |
| 2009-11-18 | -0.036 | -0.014 |
| 2009-11-19 | -0.036 | -0.014 |
| 2009-11-20 | -0.036 | -0.014 |
| 2009-11-23 | -0.036 | -0.014 |
| 2009-11-24 | -0.036 | -0.014 |
| 2009-11-25 | -0.036 | -0.014 |
| 2009-11-26 | -0.036 | -0.014 |
| 2009-11-27 | -0.036 | -0.014 |
| 2009-11-30 | -0.036 | -0.014 |
| 2009-12-01 | -0.036 | -0.014 |
| 2009-12-02 | -0.036 | -0.014 |
| 2009-12-03 | -0.036 | -0.014 |
| 2009-12-04 | -0.036 | -0.014 |
| 2009-12-07 | -0.036 | -0.014 |
| 2009-12-08 | -0.036 | -0.014 |
| 2009-12-09 | -0.036 | -0.014 |
| 2009-12-10 | -0.036 | -0.014 |
| 2009-12-11 | -0.036 | -0.014 |
| 2009-12-14 | -0.036 | -0.014 |
| 2009-12-15 | -0.02 | 0 |
| 2009-12-16 | -0.02 | 0 |
| 2009-12-17 | -0.02 | 0 |
| 2009-12-18 | -0.02 | 0 |
| 2009-12-21 | -0.02 | 0 |
| 2009-12-22 | -0.02 | 0 |
| 2009-12-23 | -0.02 | 0 |
| 2009-12-28 | -0.02 | 0 |
| 2009-12-29 | -0.02 | 0 |
| 2009-12-30 | -0.02 | 0 |
| 2009-12-31 | -0.02 | 0 |
| 2010-01-04 | -0.02 | 0 |
| 2010-01-05 | -0.02 | 0 |
| 2010-01-06 | -0.02 | 0 |
| 2010-01-07 | -0.02 | 0 |
| 2010-01-08 | -0.02 | 0 |
| 2010-01-11 | -0.02 | 0 |
| 2010-01-12 | -0.02 | 0 |
| 2010-01-13 | -0.02 | 0 |
| 2010-01-14 | -0.02 | 0 |
| 2010-01-15 | -0.042 | -0.026 |
| 2010-01-18 | -0.042 | -0.026 |
| 2010-01-19 | -0.042 | -0.026 |
| 2010-01-20 | -0.042 | -0.026 |
| 2010-01-21 | -0.042 | -0.026 |
| 2010-01-22 | -0.042 | -0.026 |
| 2010-01-25 | -0.042 | -0.026 |
| 2010-01-26 | -0.042 | -0.026 |
| 2010-01-27 | -0.042 | -0.026 |
| 2010-01-28 | -0.042 | -0.026 |
| 2010-01-29 | -0.042 | -0.026 |
| 2010-02-01 | -0.042 | -0.026 |
| 2010-02-02 | -0.042 | -0.026 |
| 2010-02-03 | -0.042 | -0.026 |
| 2010-02-04 | -0.042 | -0.026 |
| 2010-02-05 | -0.042 | -0.026 |
| 2010-02-08 | -0.042 | -0.026 |
| 2010-02-09 | -0.042 | -0.026 |
| 2010-02-10 | -0.042 | -0.026 |
| 2010-02-11 | -0.042 | -0.026 |
| 2010-02-12 | -0.062 | -0.06 |
| 2010-02-15 | -0.062 | -0.06 |
| 2010-02-16 | -0.062 | -0.06 |
| 2010-02-17 | -0.062 | -0.06 |
| 2010-02-18 | -0.062 | -0.06 |
| 2010-02-19 | -0.062 | -0.06 |
| 2010-02-22 | -0.062 | -0.06 |
| 2010-02-23 | -0.062 | -0.06 |
| 2010-02-24 | -0.062 | -0.06 |
| 2010-02-25 | -0.062 | -0.06 |
| 2010-02-26 | -0.062 | -0.06 |
| 2010-03-01 | -0.062 | -0.06 |
| 2010-03-02 | -0.062 | -0.06 |
| 2010-03-03 | -0.062 | -0.06 |
| 2010-03-04 | -0.062 | -0.06 |
| 2010-03-05 | -0.062 | -0.06 |
| 2010-03-08 | -0.062 | -0.06 |
| 2010-03-09 | -0.062 | -0.06 |
| 2010-03-10 | -0.062 | -0.06 |
| 2010-03-11 | -0.062 | -0.06 |
| 2010-03-12 | 0.013 | -0.036 |
| 2010-03-15 | 0.013 | -0.036 |
| 2010-03-16 | 0.013 | -0.036 |
| 2010-03-17 | 0.013 | -0.036 |
| 2010-03-18 | 0.013 | -0.036 |
| 2010-03-19 | 0.013 | -0.036 |
| 2010-03-22 | 0.013 | -0.036 |
| 2010-03-23 | 0.013 | -0.036 |
| 2010-03-24 | 0.013 | -0.036 |
| 2010-03-25 | 0.013 | -0.036 |
| 2010-03-26 | 0.013 | -0.036 |
| 2010-03-29 | 0.013 | -0.036 |
| 2010-03-30 | 0.013 | -0.036 |
| 2010-03-31 | 0.013 | -0.036 |
| 2010-04-01 | 0.013 | -0.036 |
| 2010-04-06 | 0.013 | -0.036 |
| 2010-04-07 | 0.013 | -0.036 |
| 2010-04-08 | 0.013 | -0.036 |
| 2010-04-09 | 0.013 | -0.036 |
| 2010-04-12 | 0.013 | -0.036 |
| 2010-04-13 | 0.022 | -0.08 |
| 2010-04-14 | 0.022 | -0.08 |
| 2010-04-15 | 0.022 | -0.08 |
| 2010-04-16 | 0.022 | -0.08 |
| 2010-04-19 | 0.022 | -0.08 |
| 2010-04-20 | 0.022 | -0.08 |
| 2010-04-21 | 0.022 | -0.08 |
| 2010-04-22 | 0.022 | -0.08 |
| 2010-04-23 | 0.022 | -0.08 |
| 2010-04-26 | 0.022 | -0.08 |
| 2010-04-27 | 0.022 | -0.08 |
| 2010-04-28 | 0.022 | -0.08 |
| 2010-04-29 | 0.022 | -0.08 |
| 2010-04-30 | 0.022 | -0.08 |
| 2010-05-04 | 0.022 | -0.08 |
| 2010-05-05 | 0.022 | -0.08 |
| 2010-05-06 | 0.022 | -0.08 |
| 2010-05-07 | 0.022 | -0.08 |
| 2010-05-10 | 0.022 | -0.08 |
| 2010-05-11 | 0.022 | -0.08 |
| 2010-05-12 | -0.033 | -0.119 |
| 2010-05-13 | -0.033 | -0.119 |
| 2010-05-14 | -0.033 | -0.119 |
| 2010-05-17 | -0.033 | -0.119 |
| 2010-05-18 | -0.033 | -0.119 |
| 2010-05-19 | -0.033 | -0.119 |
| 2010-05-20 | -0.033 | -0.119 |
| 2010-05-21 | -0.033 | -0.119 |
| 2010-05-24 | -0.033 | -0.119 |
| 2010-05-25 | -0.033 | -0.119 |
| 2010-05-26 | -0.033 | -0.119 |
| 2010-05-27 | -0.033 | -0.119 |
| 2010-05-28 | -0.033 | -0.119 |
| 2010-05-31 | -0.033 | -0.119 |
| 2010-06-01 | -0.033 | -0.119 |
| 2010-06-02 | -0.033 | -0.119 |
| 2010-06-04 | -0.033 | -0.119 |
| 2010-06-07 | -0.033 | -0.119 |
| 2010-06-08 | -0.033 | -0.119 |
| 2010-06-09 | -0.033 | -0.119 |
| 2010-06-10 | -0.047 | -0.094 |
| 2010-06-11 | -0.047 | -0.094 |
| 2010-06-14 | -0.047 | -0.094 |
| 2010-06-15 | -0.047 | -0.094 |
| 2010-06-16 | -0.047 | -0.094 |
| 2010-06-17 | -0.047 | -0.094 |
| 2010-06-18 | -0.047 | -0.094 |
| 2010-06-21 | -0.047 | -0.094 |
| 2010-06-22 | -0.047 | -0.094 |
| 2010-06-23 | -0.047 | -0.094 |
| 2010-06-24 | -0.047 | -0.094 |
| 2010-06-25 | -0.047 | -0.094 |
| 2010-06-28 | -0.047 | -0.094 |
| 2010-06-29 | -0.047 | -0.094 |
| 2010-06-30 | -0.047 | -0.094 |
| 2010-07-01 | -0.047 | -0.094 |
| 2010-07-02 | -0.047 | -0.094 |
| 2010-07-05 | -0.047 | -0.094 |
| 2010-07-06 | -0.047 | -0.094 |
| 2010-07-07 | -0.047 | -0.094 |
| 2010-07-08 | -0.009 | -0.078 |
| 2010-07-09 | -0.009 | -0.078 |
| 2010-07-12 | -0.009 | -0.078 |
| 2010-07-13 | -0.009 | -0.078 |
| 2010-07-14 | -0.009 | -0.078 |
| 2010-07-15 | -0.009 | -0.078 |
| 2010-07-16 | -0.009 | -0.078 |
| 2010-07-19 | -0.009 | -0.078 |
| 2010-07-20 | -0.009 | -0.078 |
| 2010-07-21 | -0.009 | -0.078 |
| 2010-07-22 | -0.009 | -0.078 |
| 2010-07-23 | -0.009 | -0.078 |
| 2010-07-26 | -0.009 | -0.078 |
| 2010-07-27 | -0.009 | -0.078 |
| 2010-07-28 | -0.009 | -0.078 |
| 2010-07-29 | -0.009 | -0.078 |
| 2010-07-30 | -0.009 | -0.078 |
| 2010-08-02 | -0.009 | -0.078 |
| 2010-08-03 | -0.009 | -0.078 |
| 2010-08-04 | -0.009 | -0.078 |
| 2010-08-05 | 0.002 | -0.082 |
| 2010-08-06 | 0.002 | -0.082 |
| 2010-08-09 | 0.002 | -0.082 |
| 2010-08-10 | 0.002 | -0.082 |
| 2010-08-11 | 0.002 | -0.082 |
| 2010-08-12 | 0.002 | -0.082 |
| 2010-08-13 | 0.002 | -0.082 |
| 2010-08-16 | 0.002 | -0.082 |
| 2010-08-17 | 0.002 | -0.082 |
| 2010-08-18 | 0.002 | -0.082 |
| 2010-08-19 | 0.002 | -0.082 |
| 2010-08-20 | 0.002 | -0.082 |
| 2010-08-23 | 0.002 | -0.082 |
| 2010-08-24 | 0.002 | -0.082 |
| 2010-08-25 | 0.002 | -0.082 |
| 2010-08-26 | 0.002 | -0.082 |
| 2010-08-27 | 0.002 | -0.082 |
| 2010-08-30 | 0.002 | -0.082 |
| 2010-08-31 | 0.002 | -0.082 |
| 2010-09-01 | 0.002 | -0.082 |
| 2010-09-02 | 0.037 | -0.086 |
| 2010-09-03 | 0.037 | -0.086 |
| 2010-09-06 | 0.037 | -0.086 |
| 2010-09-07 | 0.037 | -0.086 |
| 2010-09-08 | 0.037 | -0.086 |
| 2010-09-09 | 0.037 | -0.086 |
| 2010-09-10 | 0.037 | -0.086 |
| 2010-09-13 | 0.037 | -0.086 |
| 2010-09-14 | 0.037 | -0.086 |
| 2010-09-15 | 0.037 | -0.086 |
| 2010-09-16 | 0.037 | -0.086 |
| 2010-09-17 | 0.037 | -0.086 |
| 2010-09-20 | 0.037 | -0.086 |
| 2010-09-21 | 0.037 | -0.086 |
| 2010-09-22 | 0.037 | -0.086 |
| 2010-09-23 | 0.037 | -0.086 |
| 2010-09-24 | 0.037 | -0.086 |
| 2010-09-27 | 0.037 | -0.086 |
| 2010-09-28 | 0.037 | -0.086 |
| 2010-09-29 | 0.037 | -0.086 |
| 2010-09-30 | 0.075 | -0.059 |
| 2010-10-01 | 0.075 | -0.059 |
| 2010-10-04 | 0.075 | -0.059 |
| 2010-10-05 | 0.075 | -0.059 |
| 2010-10-06 | 0.075 | -0.059 |
| 2010-10-07 | 0.075 | -0.059 |
| 2010-10-08 | 0.075 | -0.059 |
| 2010-10-11 | 0.075 | -0.059 |
| 2010-10-12 | 0.075 | -0.059 |
| 2010-10-13 | 0.075 | -0.059 |
| 2010-10-14 | 0.075 | -0.059 |
| 2010-10-15 | 0.075 | -0.059 |
| 2010-10-18 | 0.075 | -0.059 |
| 2010-10-19 | 0.075 | -0.059 |
| 2010-10-20 | 0.075 | -0.059 |
| 2010-10-21 | 0.075 | -0.059 |
| 2010-10-22 | 0.075 | -0.059 |
| 2010-10-25 | 0.075 | -0.059 |
| 2010-10-26 | 0.075 | -0.059 |
| 2010-10-27 | 0.075 | -0.059 |
| 2010-10-28 | 0.094 | -0.015 |
| 2010-10-29 | 0.094 | -0.015 |
| 2010-11-02 | 0.094 | -0.015 |
| 2010-11-03 | 0.094 | -0.015 |
| 2010-11-04 | 0.094 | -0.015 |
| 2010-11-05 | 0.094 | -0.015 |
| 2010-11-08 | 0.094 | -0.015 |
| 2010-11-09 | 0.094 | -0.015 |
| 2010-11-10 | 0.094 | -0.015 |
| 2010-11-12 | 0.094 | -0.015 |
| 2010-11-15 | 0.094 | -0.015 |
| 2010-11-16 | 0.094 | -0.015 |
| 2010-11-17 | 0.094 | -0.015 |
| 2010-11-18 | 0.094 | -0.015 |
| 2010-11-19 | 0.094 | -0.015 |
| 2010-11-22 | 0.094 | -0.015 |
| 2010-11-23 | 0.094 | -0.015 |
| 2010-11-24 | 0.094 | -0.015 |
| 2010-11-25 | 0.094 | -0.015 |
| 2010-11-26 | 0.094 | -0.015 |
| 2010-11-29 | 0.114 | -0.042 |
| 2010-11-30 | 0.114 | -0.042 |
| 2010-12-01 | 0.114 | -0.042 |
| 2010-12-02 | 0.114 | -0.042 |
| 2010-12-03 | 0.114 | -0.042 |
| 2010-12-06 | 0.114 | -0.042 |
| 2010-12-07 | 0.114 | -0.042 |
| 2010-12-08 | 0.114 | -0.042 |
| 2010-12-09 | 0.114 | -0.042 |
| 2010-12-10 | 0.114 | -0.042 |
| 2010-12-13 | 0.114 | -0.042 |
| 2010-12-14 | 0.114 | -0.042 |
| 2010-12-15 | 0.114 | -0.042 |
| 2010-12-16 | 0.114 | -0.042 |
| 2010-12-17 | 0.114 | -0.042 |
| 2010-12-20 | 0.114 | -0.042 |
| 2010-12-21 | 0.114 | -0.042 |
| 2010-12-22 | 0.114 | -0.042 |
| 2010-12-23 | 0.114 | -0.042 |
| 2010-12-27 | 0.114 | -0.042 |
| 2010-12-28 | 0.11 | -0.072 |
| 2010-12-29 | 0.11 | -0.072 |
| 2010-12-30 | 0.11 | -0.072 |
| 2010-12-31 | 0.11 | -0.072 |
| 2011-01-03 | 0.11 | -0.072 |
| 2011-01-04 | 0.11 | -0.072 |
| 2011-01-05 | 0.11 | -0.072 |
| 2011-01-07 | 0.11 | -0.072 |
| 2011-01-10 | 0.11 | -0.072 |
| 2011-01-11 | 0.11 | -0.072 |
| 2011-01-12 | 0.11 | -0.072 |
| 2011-01-13 | 0.11 | -0.072 |
| 2011-01-14 | 0.11 | -0.072 |
| 2011-01-17 | 0.11 | -0.072 |
| 2011-01-18 | 0.11 | -0.072 |
| 2011-01-19 | 0.11 | -0.072 |
| 2011-01-20 | 0.11 | -0.072 |
| 2011-01-21 | 0.11 | -0.072 |
| 2011-01-24 | 0.11 | -0.072 |
| 2011-01-25 | 0.11 | -0.072 |
| 2011-01-26 | 0.102 | -0.017 |
| 2011-01-27 | 0.102 | -0.017 |
| 2011-01-28 | 0.102 | -0.017 |
| 2011-01-31 | 0.102 | -0.017 |
| 2011-02-01 | 0.102 | -0.017 |
| 2011-02-02 | 0.102 | -0.017 |
| 2011-02-03 | 0.102 | -0.017 |
| 2011-02-04 | 0.102 | -0.017 |
| 2011-02-07 | 0.102 | -0.017 |
| 2011-02-08 | 0.102 | -0.017 |
| 2011-02-09 | 0.102 | -0.017 |
| 2011-02-10 | 0.102 | -0.017 |
| 2011-02-11 | 0.102 | -0.017 |
| 2011-02-14 | 0.102 | -0.017 |
| 2011-02-15 | 0.102 | -0.017 |
| 2011-02-16 | 0.102 | -0.017 |
| 2011-02-17 | 0.102 | -0.017 |
| 2011-02-18 | 0.102 | -0.017 |
| 2011-02-21 | 0.102 | -0.017 |
| 2011-02-22 | 0.102 | -0.017 |
| 2011-02-23 | 0.117 | 0.008 |
| 2011-02-24 | 0.117 | 0.008 |
| 2011-02-25 | 0.117 | 0.008 |
| 2011-02-28 | 0.117 | 0.008 |
| 2011-03-01 | 0.117 | 0.008 |
| 2011-03-02 | 0.117 | 0.008 |
| 2011-03-03 | 0.117 | 0.008 |
| 2011-03-04 | 0.117 | 0.008 |
| 2011-03-07 | 0.117 | 0.008 |
| 2011-03-08 | 0.117 | 0.008 |
| 2011-03-09 | 0.117 | 0.008 |
| 2011-03-10 | 0.117 | 0.008 |
| 2011-03-11 | 0.117 | 0.008 |
| 2011-03-14 | 0.117 | 0.008 |
| 2011-03-15 | 0.117 | 0.008 |
| 2011-03-16 | 0.117 | 0.008 |
| 2011-03-17 | 0.117 | 0.008 |
| 2011-03-18 | 0.117 | 0.008 |
| 2011-03-21 | 0.117 | 0.008 |
| 2011-03-22 | 0.117 | 0.008 |
| 2011-03-23 | 0.167 | -0.011 |
| 2011-03-24 | 0.167 | -0.011 |
| 2011-03-25 | 0.167 | -0.011 |
| 2011-03-28 | 0.167 | -0.011 |
| 2011-03-29 | 0.167 | -0.011 |
| 2011-03-30 | 0.167 | -0.011 |
| 2011-03-31 | 0.167 | -0.011 |
| 2011-04-01 | 0.167 | -0.011 |
| 2011-04-04 | 0.167 | -0.011 |
| 2011-04-05 | 0.167 | -0.011 |
| 2011-04-06 | 0.167 | -0.011 |
| 2011-04-07 | 0.167 | -0.011 |
| 2011-04-08 | 0.167 | -0.011 |
| 2011-04-11 | 0.167 | -0.011 |
| 2011-04-12 | 0.167 | -0.011 |
| 2011-04-13 | 0.167 | -0.011 |
| 2011-04-14 | 0.167 | -0.011 |
| 2011-04-15 | 0.167 | -0.011 |
| 2011-04-18 | 0.167 | -0.011 |
| 2011-04-19 | 0.167 | -0.011 |
| 2011-04-20 | 0.168 | 0.039 |
| 2011-04-21 | 0.168 | 0.039 |
| 2011-04-26 | 0.168 | 0.039 |
| 2011-04-27 | 0.168 | 0.039 |
| 2011-04-28 | 0.168 | 0.039 |
| 2011-04-29 | 0.168 | 0.039 |
| 2011-05-02 | 0.168 | 0.039 |
| 2011-05-04 | 0.168 | 0.039 |
| 2011-05-05 | 0.168 | 0.039 |
| 2011-05-06 | 0.168 | 0.039 |
| 2011-05-09 | 0.168 | 0.039 |
| 2011-05-10 | 0.168 | 0.039 |
| 2011-05-11 | 0.168 | 0.039 |
| 2011-05-12 | 0.168 | 0.039 |
| 2011-05-13 | 0.168 | 0.039 |
| 2011-05-16 | 0.168 | 0.039 |
| 2011-05-17 | 0.168 | 0.039 |
| 2011-05-18 | 0.168 | 0.039 |
| 2011-05-19 | 0.168 | 0.039 |
| 2011-05-20 | 0.168 | 0.039 |
| 2011-05-23 | 0.168 | 0.124 |
| 2011-05-24 | 0.168 | 0.124 |
| 2011-05-25 | 0.168 | 0.124 |
| 2011-05-26 | 0.168 | 0.124 |
| 2011-05-27 | 0.168 | 0.124 |
| 2011-05-30 | 0.168 | 0.124 |
| 2011-05-31 | 0.168 | 0.124 |
| 2011-06-01 | 0.168 | 0.124 |
| 2011-06-02 | 0.168 | 0.124 |
| 2011-06-03 | 0.168 | 0.124 |
| 2011-06-06 | 0.168 | 0.124 |
| 2011-06-07 | 0.168 | 0.124 |
| 2011-06-08 | 0.168 | 0.124 |
| 2011-06-09 | 0.168 | 0.124 |
| 2011-06-10 | 0.168 | 0.124 |
| 2011-06-13 | 0.168 | 0.124 |
| 2011-06-14 | 0.168 | 0.124 |
| 2011-06-15 | 0.168 | 0.124 |
| 2011-06-16 | 0.168 | 0.124 |
| 2011-06-17 | 0.168 | 0.124 |
| 2011-06-20 | 0.134 | 0.145 |
| 2011-06-21 | 0.134 | 0.145 |
| 2011-06-22 | 0.134 | 0.145 |
| 2011-06-24 | 0.134 | 0.145 |
| 2011-06-27 | 0.134 | 0.145 |
| 2011-06-28 | 0.134 | 0.145 |
| 2011-06-29 | 0.134 | 0.145 |
| 2011-06-30 | 0.134 | 0.145 |
| 2011-07-01 | 0.134 | 0.145 |
| 2011-07-04 | 0.134 | 0.145 |
| 2011-07-05 | 0.134 | 0.145 |
| 2011-07-06 | 0.134 | 0.145 |
| 2011-07-07 | 0.134 | 0.145 |
| 2011-07-08 | 0.134 | 0.145 |
| 2011-07-11 | 0.134 | 0.145 |
| 2011-07-12 | 0.134 | 0.145 |
| 2011-07-13 | 0.134 | 0.145 |
| 2011-07-14 | 0.134 | 0.145 |
| 2011-07-15 | 0.134 | 0.145 |
| 2011-07-18 | 0.134 | 0.145 |
| 2011-07-19 | 0.043 | 0.07 |
| 2011-07-20 | 0.043 | 0.07 |
| 2011-07-21 | 0.043 | 0.07 |
| 2011-07-22 | 0.043 | 0.07 |
| 2011-07-25 | 0.043 | 0.07 |
| 2011-07-26 | 0.043 | 0.07 |
| 2011-07-27 | 0.043 | 0.07 |
| 2011-07-28 | 0.043 | 0.07 |
| 2011-07-29 | 0.043 | 0.07 |
| 2011-08-01 | 0.043 | 0.07 |
| 2011-08-02 | 0.043 | 0.07 |
| 2011-08-03 | 0.043 | 0.07 |
| 2011-08-04 | 0.043 | 0.07 |
| 2011-08-05 | 0.043 | 0.07 |
| 2011-08-08 | 0.043 | 0.07 |
| 2011-08-09 | 0.043 | 0.07 |
| 2011-08-10 | 0.043 | 0.07 |
| 2011-08-11 | 0.043 | 0.07 |
| 2011-08-12 | 0.043 | 0.07 |
| 2011-08-16 | 0.043 | 0.07 |
| 2011-08-17 | -0.057 | 0.033 |
| 2011-08-18 | -0.057 | 0.033 |
| 2011-08-19 | -0.057 | 0.033 |
| 2011-08-22 | -0.057 | 0.033 |
| 2011-08-23 | -0.057 | 0.033 |
| 2011-08-24 | -0.057 | 0.033 |
| 2011-08-25 | -0.057 | 0.033 |
| 2011-08-26 | -0.057 | 0.033 |
| 2011-08-29 | -0.057 | 0.033 |
| 2011-08-30 | -0.057 | 0.033 |
| 2011-08-31 | -0.057 | 0.033 |
| 2011-09-01 | -0.057 | 0.033 |
| 2011-09-02 | -0.057 | 0.033 |
| 2011-09-05 | -0.057 | 0.033 |
| 2011-09-06 | -0.057 | 0.033 |
| 2011-09-07 | -0.057 | 0.033 |
| 2011-09-08 | -0.057 | 0.033 |
| 2011-09-09 | -0.057 | 0.033 |
| 2011-09-12 | -0.057 | 0.033 |
| 2011-09-13 | -0.057 | 0.033 |
| 2011-09-14 | -0.104 | 0.05 |
| 2011-09-15 | -0.104 | 0.05 |
| 2011-09-16 | -0.104 | 0.05 |
| 2011-09-19 | -0.104 | 0.05 |
| 2011-09-20 | -0.104 | 0.05 |
| 2011-09-21 | -0.104 | 0.05 |
| 2011-09-22 | -0.104 | 0.05 |
| 2011-09-23 | -0.104 | 0.05 |
| 2011-09-26 | -0.104 | 0.05 |
| 2011-09-27 | -0.104 | 0.05 |
| 2011-09-28 | -0.104 | 0.05 |
| 2011-09-29 | -0.104 | 0.05 |
| 2011-09-30 | -0.104 | 0.05 |
| 2011-10-03 | -0.104 | 0.05 |
| 2011-10-04 | -0.104 | 0.05 |
| 2011-10-05 | -0.104 | 0.05 |
| 2011-10-06 | -0.104 | 0.05 |
| 2011-10-07 | -0.104 | 0.05 |
| 2011-10-10 | -0.104 | 0.05 |
| 2011-10-11 | -0.104 | 0.05 |
| 2011-10-12 | -0.048 | 0.032 |
| 2011-10-13 | -0.048 | 0.032 |
| 2011-10-14 | -0.048 | 0.032 |
| 2011-10-17 | -0.048 | 0.032 |
| 2011-10-18 | -0.048 | 0.032 |
| 2011-10-19 | -0.048 | 0.032 |
| 2011-10-20 | -0.048 | 0.032 |
| 2011-10-21 | -0.048 | 0.032 |
| 2011-10-24 | -0.048 | 0.032 |
| 2011-10-25 | -0.048 | 0.032 |
| 2011-10-26 | -0.048 | 0.032 |
| 2011-10-27 | -0.048 | 0.032 |
| 2011-10-28 | -0.048 | 0.032 |
| 2011-10-31 | -0.048 | 0.032 |
| 2011-11-02 | -0.048 | 0.032 |
| 2011-11-03 | -0.048 | 0.032 |
| 2011-11-04 | -0.048 | 0.032 |
| 2011-11-07 | -0.048 | 0.032 |
| 2011-11-08 | -0.048 | 0.032 |
| 2011-11-09 | -0.048 | 0.032 |
| 2011-11-10 | -0.088 | 0.04 |
| 2011-11-14 | -0.088 | 0.04 |
| 2011-11-15 | -0.088 | 0.04 |
| 2011-11-16 | -0.088 | 0.04 |
| 2011-11-17 | -0.088 | 0.04 |
| 2011-11-18 | -0.088 | 0.04 |
| 2011-11-21 | -0.088 | 0.04 |
| 2011-11-22 | -0.088 | 0.04 |
| 2011-11-23 | -0.088 | 0.04 |
| 2011-11-24 | -0.088 | 0.04 |
| 2011-11-25 | -0.088 | 0.04 |
| 2011-11-28 | -0.088 | 0.04 |
| 2011-11-29 | -0.088 | 0.04 |
| 2011-11-30 | -0.088 | 0.04 |
| 2011-12-01 | -0.088 | 0.04 |
| 2011-12-02 | -0.088 | 0.04 |
| 2011-12-05 | -0.088 | 0.04 |
| 2011-12-06 | -0.088 | 0.04 |
| 2011-12-07 | -0.088 | 0.04 |
| 2011-12-08 | -0.088 | 0.04 |
| 2011-12-09 | -0.12 | 0.078 |
| 2011-12-12 | -0.12 | 0.078 |
| 2011-12-13 | -0.12 | 0.078 |
| 2011-12-14 | -0.12 | 0.078 |
| 2011-12-15 | -0.12 | 0.078 |
| 2011-12-16 | -0.12 | 0.078 |
| 2011-12-19 | -0.12 | 0.078 |
| 2011-12-20 | -0.12 | 0.078 |
| 2011-12-21 | -0.12 | 0.078 |
| 2011-12-22 | -0.12 | 0.078 |
| 2011-12-23 | -0.12 | 0.078 |
| 2011-12-27 | -0.12 | 0.078 |
| 2011-12-28 | -0.12 | 0.078 |
| 2011-12-29 | -0.12 | 0.078 |
| 2011-12-30 | -0.12 | 0.078 |
| 2012-01-02 | -0.12 | 0.078 |
| 2012-01-03 | -0.12 | 0.078 |
| 2012-01-04 | -0.12 | 0.078 |
| 2012-01-05 | -0.12 | 0.078 |
| 2012-01-09 | -0.12 | 0.078 |
| 2012-01-10 | -0.079 | 0.02 |
| 2012-01-11 | -0.079 | 0.02 |
| 2012-01-12 | -0.079 | 0.02 |
| 2012-01-13 | -0.079 | 0.02 |
| 2012-01-16 | -0.079 | 0.02 |
| 2012-01-17 | -0.079 | 0.02 |
| 2012-01-18 | -0.079 | 0.02 |
| 2012-01-19 | -0.079 | 0.02 |
| 2012-01-20 | -0.079 | 0.02 |
| 2012-01-23 | -0.079 | 0.02 |
| 2012-01-24 | -0.079 | 0.02 |
| 2012-01-25 | -0.079 | 0.02 |
| 2012-01-26 | -0.079 | 0.02 |
| 2012-01-27 | -0.079 | 0.02 |
| 2012-01-30 | -0.079 | 0.02 |
| 2012-01-31 | -0.079 | 0.02 |
| 2012-02-01 | -0.079 | 0.02 |
| 2012-02-02 | -0.079 | 0.02 |
| 2012-02-03 | -0.079 | 0.02 |
| 2012-02-06 | -0.079 | 0.02 |
| 2012-02-07 | -0.051 | -0.028 |
| 2012-02-08 | -0.051 | -0.028 |
| 2012-02-09 | -0.051 | -0.028 |
| 2012-02-10 | -0.051 | -0.028 |
| 2012-02-13 | -0.051 | -0.028 |
| 2012-02-14 | -0.051 | -0.028 |
| 2012-02-15 | -0.051 | -0.028 |
| 2012-02-16 | -0.051 | -0.028 |
| 2012-02-17 | -0.051 | -0.028 |
| 2012-02-20 | -0.051 | -0.028 |
| 2012-02-21 | -0.051 | -0.028 |
| 2012-02-22 | -0.051 | -0.028 |
| 2012-02-23 | -0.051 | -0.028 |
| 2012-02-24 | -0.051 | -0.028 |
| 2012-02-27 | -0.051 | -0.028 |
| 2012-02-28 | -0.051 | -0.028 |
| 2012-02-29 | -0.051 | -0.028 |
| 2012-03-01 | -0.051 | -0.028 |
| 2012-03-02 | -0.051 | -0.028 |
| 2012-03-05 | -0.051 | -0.028 |
| 2012-03-06 | -0.064 | 0.026 |
| 2012-03-07 | -0.064 | 0.026 |
| 2012-03-08 | -0.064 | 0.026 |
| 2012-03-09 | -0.064 | 0.026 |
| 2012-03-12 | -0.064 | 0.026 |
| 2012-03-13 | -0.064 | 0.026 |
| 2012-03-14 | -0.064 | 0.026 |
| 2012-03-15 | -0.064 | 0.026 |
| 2012-03-16 | -0.064 | 0.026 |
| 2012-03-19 | -0.064 | 0.026 |
| 2012-03-20 | -0.064 | 0.026 |
| 2012-03-21 | -0.064 | 0.026 |
| 2012-03-22 | -0.064 | 0.026 |
| 2012-03-23 | -0.064 | 0.026 |
| 2012-03-26 | -0.064 | 0.026 |
| 2012-03-27 | -0.064 | 0.026 |
| 2012-03-28 | -0.064 | 0.026 |
| 2012-03-29 | -0.064 | 0.026 |
| 2012-03-30 | -0.064 | 0.026 |
| 2012-04-02 | -0.064 | 0.026 |
| 2012-04-03 | -0.09 | 0.077 |
| 2012-04-04 | -0.09 | 0.077 |
| 2012-04-05 | -0.09 | 0.077 |
| 2012-04-10 | -0.09 | 0.077 |
| 2012-04-11 | -0.09 | 0.077 |
| 2012-04-12 | -0.09 | 0.077 |
| 2012-04-13 | -0.09 | 0.077 |
| 2012-04-16 | -0.09 | 0.077 |
| 2012-04-17 | -0.09 | 0.077 |
| 2012-04-18 | -0.09 | 0.077 |
| 2012-04-19 | -0.09 | 0.077 |
| 2012-04-20 | -0.09 | 0.077 |
| 2012-04-23 | -0.09 | 0.077 |
| 2012-04-24 | -0.09 | 0.077 |
| 2012-04-25 | -0.09 | 0.077 |
| 2012-04-26 | -0.09 | 0.077 |
| 2012-04-27 | -0.09 | 0.077 |
| 2012-04-30 | -0.09 | 0.077 |
| 2012-05-02 | -0.09 | 0.077 |
| 2012-05-04 | -0.09 | 0.077 |
| 2012-05-07 | -0.143 | 0.021 |
| 2012-05-08 | -0.143 | 0.021 |
| 2012-05-09 | -0.143 | 0.021 |
| 2012-05-10 | -0.143 | 0.021 |
| 2012-05-11 | -0.143 | 0.021 |
| 2012-05-14 | -0.143 | 0.021 |
| 2012-05-15 | -0.143 | 0.021 |
| 2012-05-16 | -0.143 | 0.021 |
| 2012-05-17 | -0.143 | 0.021 |
| 2012-05-18 | -0.143 | 0.021 |
| 2012-05-21 | -0.143 | 0.021 |
| 2012-05-22 | -0.143 | 0.021 |
| 2012-05-23 | -0.143 | 0.021 |
| 2012-05-24 | -0.143 | 0.021 |
| 2012-05-25 | -0.143 | 0.021 |
| 2012-05-28 | -0.143 | 0.021 |
| 2012-05-29 | -0.143 | 0.021 |
| 2012-05-30 | -0.143 | 0.021 |
| 2012-05-31 | -0.143 | 0.021 |
| 2012-06-01 | -0.143 | 0.021 |
| 2012-06-04 | -0.101 | 0.056 |
| 2012-06-05 | -0.101 | 0.056 |
| 2012-06-06 | -0.101 | 0.056 |
| 2012-06-08 | -0.101 | 0.056 |
| 2012-06-11 | -0.101 | 0.056 |
| 2012-06-12 | -0.101 | 0.056 |
| 2012-06-13 | -0.101 | 0.056 |
| 2012-06-14 | -0.101 | 0.056 |
| 2012-06-15 | -0.101 | 0.056 |
| 2012-06-18 | -0.101 | 0.056 |
| 2012-06-19 | -0.101 | 0.056 |
| 2012-06-20 | -0.101 | 0.056 |
| 2012-06-21 | -0.101 | 0.056 |
| 2012-06-22 | -0.101 | 0.056 |
| 2012-06-25 | -0.101 | 0.056 |
| 2012-06-26 | -0.101 | 0.056 |
| 2012-06-27 | -0.101 | 0.056 |
| 2012-06-28 | -0.101 | 0.056 |
| 2012-06-29 | -0.101 | 0.056 |
| 2012-07-02 | -0.101 | 0.056 |
| 2012-07-03 | -0.105 | 0.052 |
| 2012-07-04 | -0.105 | 0.052 |
| 2012-07-05 | -0.105 | 0.052 |
| 2012-07-06 | -0.105 | 0.052 |
| 2012-07-09 | -0.105 | 0.052 |
| 2012-07-10 | -0.105 | 0.052 |
| 2012-07-11 | -0.105 | 0.052 |
| 2012-07-12 | -0.105 | 0.052 |
| 2012-07-13 | -0.105 | 0.052 |
| 2012-07-16 | -0.105 | 0.052 |
| 2012-07-17 | -0.105 | 0.052 |
| 2012-07-18 | -0.105 | 0.052 |
| 2012-07-19 | -0.105 | 0.052 |
| 2012-07-20 | -0.105 | 0.052 |
| 2012-07-24 | -0.105 | 0.052 |
| 2012-07-25 | -0.105 | 0.052 |
| 2012-07-26 | -0.105 | 0.052 |
| 2012-07-27 | -0.105 | 0.052 |
| 2012-07-30 | -0.105 | 0.052 |
| 2012-07-31 | -0.105 | 0.052 |
| 2012-08-01 | -0.074 | 0.081 |
| 2012-08-02 | -0.074 | 0.081 |
| 2012-08-03 | -0.074 | 0.081 |
| 2012-08-06 | -0.074 | 0.081 |
| 2012-08-07 | -0.074 | 0.081 |
| 2012-08-08 | -0.074 | 0.081 |
| 2012-08-09 | -0.074 | 0.081 |
| 2012-08-10 | -0.074 | 0.081 |
| 2012-08-13 | -0.074 | 0.081 |
| 2012-08-14 | -0.074 | 0.081 |
| 2012-08-16 | -0.074 | 0.081 |
| 2012-08-17 | -0.074 | 0.081 |
| 2012-08-20 | -0.074 | 0.081 |
| 2012-08-21 | -0.074 | 0.081 |
| 2012-08-22 | -0.074 | 0.081 |
| 2012-08-23 | -0.074 | 0.081 |
| 2012-08-24 | -0.074 | 0.081 |
| 2012-08-27 | -0.074 | 0.081 |
| 2012-08-28 | -0.074 | 0.081 |
| 2012-08-29 | -0.074 | 0.081 |
| 2012-08-30 | -0.048 | 0.064 |
| 2012-08-31 | -0.048 | 0.064 |
| 2012-09-03 | -0.048 | 0.064 |
| 2012-09-04 | -0.048 | 0.064 |
| 2012-09-05 | -0.048 | 0.064 |
| 2012-09-06 | -0.048 | 0.064 |
| 2012-09-07 | -0.048 | 0.064 |
| 2012-09-10 | -0.048 | 0.064 |
| 2012-09-11 | -0.048 | 0.064 |
| 2012-09-12 | -0.048 | 0.064 |
| 2012-09-13 | -0.048 | 0.064 |
| 2012-09-14 | -0.048 | 0.064 |
| 2012-09-17 | -0.048 | 0.064 |
| 2012-09-18 | -0.048 | 0.064 |
| 2012-09-19 | -0.048 | 0.064 |
| 2012-09-20 | -0.048 | 0.064 |
| 2012-09-21 | -0.048 | 0.064 |
| 2012-09-24 | -0.048 | 0.064 |
| 2012-09-25 | -0.048 | 0.064 |
| 2012-09-26 | -0.048 | 0.064 |
| 2012-09-27 | -0.032 | 0.048 |
| 2012-09-28 | -0.032 | 0.048 |
| 2012-10-01 | -0.032 | 0.048 |
| 2012-10-02 | -0.032 | 0.048 |
| 2012-10-03 | -0.032 | 0.048 |
| 2012-10-04 | -0.032 | 0.048 |
| 2012-10-05 | -0.032 | 0.048 |
| 2012-10-08 | -0.032 | 0.048 |
| 2012-10-09 | -0.032 | 0.048 |
| 2012-10-10 | -0.032 | 0.048 |
| 2012-10-11 | -0.032 | 0.048 |
| 2012-10-12 | -0.032 | 0.048 |
| 2012-10-15 | -0.032 | 0.048 |
| 2012-10-16 | -0.032 | 0.048 |
| 2012-10-17 | -0.032 | 0.048 |
| 2012-10-18 | -0.032 | 0.048 |
| 2012-10-19 | -0.032 | 0.048 |
| 2012-10-22 | -0.032 | 0.048 |
| 2012-10-23 | -0.032 | 0.048 |
| 2012-10-24 | -0.032 | 0.048 |
| 2012-10-25 | -0.044 | 0.101 |
| 2012-10-26 | -0.044 | 0.101 |
| 2012-10-29 | -0.044 | 0.101 |
| 2012-10-30 | -0.044 | 0.101 |
| 2012-10-31 | -0.044 | 0.101 |
| 2012-11-02 | -0.044 | 0.101 |
| 2012-11-05 | -0.044 | 0.101 |
| 2012-11-06 | -0.044 | 0.101 |
| 2012-11-07 | -0.044 | 0.101 |
| 2012-11-08 | -0.044 | 0.101 |
| 2012-11-09 | -0.044 | 0.101 |
| 2012-11-12 | -0.044 | 0.101 |
| 2012-11-13 | -0.044 | 0.101 |
| 2012-11-14 | -0.044 | 0.101 |
| 2012-11-15 | -0.044 | 0.101 |
| 2012-11-16 | -0.044 | 0.101 |
| 2012-11-19 | -0.044 | 0.101 |
| 2012-11-20 | -0.044 | 0.101 |
| 2012-11-21 | -0.044 | 0.101 |
| 2012-11-22 | -0.044 | 0.101 |
| 2012-11-23 | 0.01 | 0.223 |
| 2012-11-26 | 0.01 | 0.223 |
| 2012-11-27 | 0.01 | 0.223 |
| 2012-11-28 | 0.01 | 0.223 |
| 2012-11-29 | 0.01 | 0.223 |
| 2012-11-30 | 0.01 | 0.223 |
| 2012-12-03 | 0.01 | 0.223 |
| 2012-12-04 | 0.01 | 0.223 |
| 2012-12-05 | 0.01 | 0.223 |
| 2012-12-06 | 0.01 | 0.223 |
| 2012-12-07 | 0.01 | 0.223 |
| 2012-12-10 | 0.01 | 0.223 |
| 2012-12-11 | 0.01 | 0.223 |
| 2012-12-12 | 0.01 | 0.223 |
| 2012-12-13 | 0.01 | 0.223 |
| 2012-12-14 | 0.01 | 0.223 |
| 2012-12-17 | 0.01 | 0.223 |
| 2012-12-18 | 0.01 | 0.223 |
| 2012-12-19 | 0.01 | 0.223 |
| 2012-12-20 | 0.01 | 0.223 |
| 2012-12-21 | 0.049 | 0.421 |
| 2012-12-27 | 0.049 | 0.421 |
| 2012-12-28 | 0.049 | 0.421 |
| 2013-01-02 | 0.049 | 0.421 |
| 2013-01-03 | 0.049 | 0.421 |
| 2013-01-04 | 0.049 | 0.421 |
| 2013-01-07 | 0.049 | 0.421 |
| 2013-01-08 | 0.049 | 0.421 |
| 2013-01-09 | 0.049 | 0.421 |
| 2013-01-10 | 0.049 | 0.421 |
| 2013-01-11 | 0.049 | 0.421 |
| 2013-01-14 | 0.049 | 0.421 |
| 2013-01-15 | 0.049 | 0.421 |
| 2013-01-16 | 0.049 | 0.421 |
| 2013-01-17 | 0.049 | 0.421 |
| 2013-01-18 | 0.049 | 0.421 |
| 2013-01-21 | 0.049 | 0.421 |
| 2013-01-22 | 0.049 | 0.421 |
| 2013-01-23 | 0.049 | 0.421 |
| 2013-01-24 | 0.049 | 0.421 |
| 2013-01-25 | 0.01 | 0.475 |
| 2013-01-28 | 0.01 | 0.475 |
| 2013-01-29 | 0.01 | 0.475 |
| 2013-01-30 | 0.01 | 0.475 |
| 2013-01-31 | 0.01 | 0.475 |
| 2013-02-01 | 0.01 | 0.475 |
| 2013-02-04 | 0.01 | 0.475 |
| 2013-02-05 | 0.01 | 0.475 |
| 2013-02-06 | 0.01 | 0.475 |
| 2013-02-07 | 0.01 | 0.475 |
| 2013-02-08 | 0.01 | 0.475 |
| 2013-02-11 | 0.01 | 0.475 |
| 2013-02-12 | 0.01 | 0.475 |
| 2013-02-13 | 0.01 | 0.475 |
| 2013-02-14 | 0.01 | 0.475 |
| 2013-02-15 | 0.01 | 0.475 |
| 2013-02-18 | 0.01 | 0.475 |
| 2013-02-19 | 0.01 | 0.475 |
| 2013-02-20 | 0.01 | 0.475 |
| 2013-02-21 | 0.01 | 0.475 |
| 2013-02-22 | 0 | 0.522 |
| 2013-02-25 | 0 | 0.522 |
| 2013-02-26 | 0 | 0.522 |
| 2013-02-27 | 0 | 0.522 |
| 2013-02-28 | 0 | 0.522 |
| 2013-03-01 | 0 | 0.522 |
| 2013-03-04 | 0 | 0.522 |
| 2013-03-05 | 0 | 0.522 |
| 2013-03-06 | 0 | 0.522 |
| 2013-03-07 | 0 | 0.522 |
| 2013-03-08 | 0 | 0.522 |
| 2013-03-11 | 0 | 0.522 |
| 2013-03-12 | 0 | 0.522 |
| 2013-03-13 | 0 | 0.522 |
| 2013-03-14 | 0 | 0.522 |
| 2013-03-15 | 0 | 0.522 |
| 2013-03-18 | 0 | 0.522 |
| 2013-03-19 | 0 | 0.522 |
| 2013-03-20 | 0 | 0.522 |
| 2013-03-21 | 0 | 0.522 |
| 2013-03-22 | -0.047 | 0.437 |
| 2013-03-25 | -0.047 | 0.437 |
| 2013-03-26 | -0.047 | 0.437 |
| 2013-03-27 | -0.047 | 0.437 |
| 2013-03-28 | -0.047 | 0.437 |
| 2013-04-02 | -0.047 | 0.437 |
| 2013-04-03 | -0.047 | 0.437 |
| 2013-04-04 | -0.047 | 0.437 |
| 2013-04-05 | -0.047 | 0.437 |
| 2013-04-08 | -0.047 | 0.437 |
| 2013-04-09 | -0.047 | 0.437 |
| 2013-04-10 | -0.047 | 0.437 |
| 2013-04-11 | -0.047 | 0.437 |
| 2013-04-12 | -0.047 | 0.437 |
| 2013-04-15 | -0.047 | 0.437 |
| 2013-04-17 | -0.047 | 0.437 |
| 2013-04-18 | -0.047 | 0.437 |
| 2013-04-19 | -0.047 | 0.437 |
| 2013-04-22 | -0.047 | 0.437 |
| 2013-04-23 | -0.047 | 0.437 |
| 2013-04-24 | -0.044 | 0.494 |
| 2013-04-25 | -0.044 | 0.494 |
| 2013-04-26 | -0.044 | 0.494 |
| 2013-04-29 | -0.044 | 0.494 |
| 2013-04-30 | -0.044 | 0.494 |
| 2013-05-02 | -0.044 | 0.494 |
| 2013-05-06 | -0.044 | 0.494 |
| 2013-05-07 | -0.044 | 0.494 |
| 2013-05-08 | -0.044 | 0.494 |
| 2013-05-09 | -0.044 | 0.494 |
| 2013-05-10 | -0.044 | 0.494 |
| 2013-05-13 | -0.044 | 0.494 |
| 2013-05-14 | -0.044 | 0.494 |
| 2013-05-15 | -0.044 | 0.494 |
| 2013-05-16 | -0.044 | 0.494 |
| 2013-05-17 | -0.044 | 0.494 |
| 2013-05-20 | -0.044 | 0.494 |
| 2013-05-21 | -0.044 | 0.494 |
| 2013-05-22 | -0.044 | 0.494 |
| 2013-05-23 | -0.044 | 0.494 |
| 2013-05-24 | -0.006 | 0.631 |
| 2013-05-27 | -0.006 | 0.631 |
| 2013-05-28 | -0.006 | 0.631 |
| 2013-05-29 | -0.006 | 0.631 |
| 2013-05-31 | -0.006 | 0.631 |
| 2013-06-03 | -0.006 | 0.631 |
| 2013-06-04 | -0.006 | 0.631 |
| 2013-06-05 | -0.006 | 0.631 |
| 2013-06-06 | -0.006 | 0.631 |
| 2013-06-07 | -0.006 | 0.631 |
| 2013-06-10 | -0.006 | 0.631 |
| 2013-06-11 | -0.006 | 0.631 |
| 2013-06-12 | -0.006 | 0.631 |
| 2013-06-13 | -0.006 | 0.631 |
| 2013-06-14 | -0.006 | 0.631 |
| 2013-06-17 | -0.006 | 0.631 |
| 2013-06-18 | -0.006 | 0.631 |
| 2013-06-19 | -0.006 | 0.631 |
| 2013-06-20 | -0.006 | 0.631 |
| 2013-06-21 | -0.006 | 0.631 |
| 2013-06-24 | -0.078 | 0.587 |
| 2013-06-25 | -0.078 | 0.587 |
| 2013-06-26 | -0.078 | 0.587 |
| 2013-06-27 | -0.078 | 0.587 |
| 2013-06-28 | -0.078 | 0.587 |
| 2013-07-01 | -0.078 | 0.587 |
| 2013-07-02 | -0.078 | 0.587 |
| 2013-07-03 | -0.078 | 0.587 |
| 2013-07-04 | -0.078 | 0.587 |
| 2013-07-05 | -0.078 | 0.587 |
| 2013-07-08 | -0.078 | 0.587 |
| 2013-07-09 | -0.078 | 0.587 |
| 2013-07-10 | -0.078 | 0.587 |
| 2013-07-11 | -0.078 | 0.587 |
| 2013-07-12 | -0.078 | 0.587 |
| 2013-07-15 | -0.078 | 0.587 |
| 2013-07-16 | -0.078 | 0.587 |
| 2013-07-17 | -0.078 | 0.587 |
| 2013-07-18 | -0.078 | 0.587 |
| 2013-07-19 | -0.078 | 0.587 |
| 2013-07-22 | -0.034 | 0.649 |
| 2013-07-23 | -0.034 | 0.649 |
| 2013-07-24 | -0.034 | 0.649 |
| 2013-07-25 | -0.034 | 0.649 |
| 2013-07-26 | -0.034 | 0.649 |
| 2013-07-29 | -0.034 | 0.649 |
| 2013-07-30 | -0.034 | 0.649 |
| 2013-07-31 | -0.034 | 0.649 |
| 2013-08-01 | -0.034 | 0.649 |
| 2013-08-02 | -0.034 | 0.649 |
| 2013-08-05 | -0.034 | 0.649 |
| 2013-08-06 | -0.034 | 0.649 |
| 2013-08-07 | -0.034 | 0.649 |
| 2013-08-08 | -0.034 | 0.649 |
| 2013-08-09 | -0.034 | 0.649 |
| 2013-08-12 | -0.034 | 0.649 |
| 2013-08-13 | -0.034 | 0.649 |
| 2013-08-14 | -0.034 | 0.649 |
| 2013-08-16 | -0.034 | 0.649 |
| 2013-08-19 | -0.034 | 0.649 |
| 2013-08-20 | -0.039 | 0.596 |
| 2013-08-21 | -0.039 | 0.596 |
| 2013-08-22 | -0.039 | 0.596 |
| 2013-08-23 | -0.039 | 0.596 |
| 2013-08-26 | -0.039 | 0.596 |
| 2013-08-27 | -0.039 | 0.596 |
| 2013-08-28 | -0.039 | 0.596 |
| 2013-08-29 | -0.039 | 0.596 |
| 2013-08-30 | -0.039 | 0.596 |
| 2013-09-02 | -0.039 | 0.596 |
| 2013-09-03 | -0.039 | 0.596 |
| 2013-09-04 | -0.039 | 0.596 |
| 2013-09-05 | -0.039 | 0.596 |
| 2013-09-06 | -0.039 | 0.596 |
| 2013-09-09 | -0.039 | 0.596 |
| 2013-09-10 | -0.039 | 0.596 |
| 2013-09-11 | -0.039 | 0.596 |
| 2013-09-12 | -0.039 | 0.596 |
| 2013-09-13 | -0.039 | 0.596 |
| 2013-09-16 | -0.039 | 0.596 |
| 2013-09-17 | -0.019 | 0.583 |
| 2013-09-18 | -0.019 | 0.583 |
| 2013-09-19 | -0.019 | 0.583 |
| 2013-09-20 | -0.019 | 0.583 |
| 2013-09-23 | -0.019 | 0.583 |
| 2013-09-24 | -0.019 | 0.583 |
| 2013-09-25 | -0.019 | 0.583 |
| 2013-09-26 | -0.019 | 0.583 |
| 2013-09-27 | -0.019 | 0.583 |
| 2013-09-30 | -0.019 | 0.583 |
| 2013-10-01 | -0.019 | 0.583 |
| 2013-10-02 | -0.019 | 0.583 |
| 2013-10-03 | -0.019 | 0.583 |
| 2013-10-04 | -0.019 | 0.583 |
| 2013-10-07 | -0.019 | 0.583 |
| 2013-10-08 | -0.019 | 0.583 |
| 2013-10-09 | -0.019 | 0.583 |
| 2013-10-10 | -0.019 | 0.583 |
| 2013-10-11 | -0.019 | 0.583 |
| 2013-10-14 | -0.019 | 0.583 |
| 2013-10-15 | 0.028 | 0.506 |
| 2013-10-16 | 0.028 | 0.506 |
| 2013-10-17 | 0.028 | 0.506 |
| 2013-10-18 | 0.028 | 0.506 |
| 2013-10-21 | 0.028 | 0.506 |
| 2013-10-22 | 0.028 | 0.506 |
| 2013-10-23 | 0.028 | 0.506 |
| 2013-10-24 | 0.028 | 0.506 |
| 2013-10-25 | 0.028 | 0.506 |
| 2013-10-28 | 0.028 | 0.506 |
| 2013-10-29 | 0.028 | 0.506 |
| 2013-10-30 | 0.028 | 0.506 |
| 2013-10-31 | 0.028 | 0.506 |
| 2013-11-04 | 0.028 | 0.506 |
| 2013-11-05 | 0.028 | 0.506 |
| 2013-11-06 | 0.028 | 0.506 |
| 2013-11-07 | 0.028 | 0.506 |
| 2013-11-08 | 0.028 | 0.506 |
| 2013-11-12 | 0.028 | 0.506 |
| 2013-11-13 | 0.028 | 0.506 |
| 2013-11-14 | 0.036 | 0.503 |
| 2013-11-15 | 0.036 | 0.503 |
| 2013-11-18 | 0.036 | 0.503 |
| 2013-11-19 | 0.036 | 0.503 |
| 2013-11-20 | 0.036 | 0.503 |
| 2013-11-21 | 0.036 | 0.503 |
| 2013-11-22 | 0.036 | 0.503 |
| 2013-11-25 | 0.036 | 0.503 |
| 2013-11-26 | 0.036 | 0.503 |
| 2013-11-27 | 0.036 | 0.503 |
| 2013-11-28 | 0.036 | 0.503 |
| 2013-11-29 | 0.036 | 0.503 |
| 2013-12-02 | 0.036 | 0.503 |
| 2013-12-03 | 0.036 | 0.503 |
| 2013-12-04 | 0.036 | 0.503 |
| 2013-12-05 | 0.036 | 0.503 |
| 2013-12-06 | 0.036 | 0.503 |
| 2013-12-09 | 0.036 | 0.503 |
| 2013-12-10 | 0.036 | 0.503 |
| 2013-12-11 | 0.036 | 0.503 |
| 2013-12-12 | -0.026 | 0.347 |
| 2013-12-13 | -0.026 | 0.347 |
| 2013-12-16 | -0.026 | 0.347 |
| 2013-12-17 | -0.026 | 0.347 |
| 2013-12-18 | -0.026 | 0.347 |
| 2013-12-19 | -0.026 | 0.347 |
| 2013-12-20 | -0.026 | 0.347 |
| 2013-12-23 | -0.026 | 0.347 |
| 2013-12-27 | -0.026 | 0.347 |
| 2013-12-30 | -0.026 | 0.347 |
| 2014-01-02 | -0.026 | 0.347 |
| 2014-01-03 | -0.026 | 0.347 |
| 2014-01-07 | -0.026 | 0.347 |
| 2014-01-08 | -0.026 | 0.347 |
| 2014-01-09 | -0.026 | 0.347 |
| 2014-01-10 | -0.026 | 0.347 |
| 2014-01-13 | -0.026 | 0.347 |
| 2014-01-14 | -0.026 | 0.347 |
| 2014-01-15 | -0.026 | 0.347 |
| 2014-01-16 | -0.026 | 0.347 |
| 2014-01-17 | -0.028 | 0.276 |
| 2014-01-20 | -0.028 | 0.276 |
| 2014-01-21 | -0.028 | 0.276 |
| 2014-01-22 | -0.028 | 0.276 |
| 2014-01-23 | -0.028 | 0.276 |
| 2014-01-24 | -0.028 | 0.276 |
| 2014-01-27 | -0.028 | 0.276 |
| 2014-01-28 | -0.028 | 0.276 |
| 2014-01-29 | -0.028 | 0.276 |
| 2014-01-30 | -0.028 | 0.276 |
| 2014-01-31 | -0.028 | 0.276 |
| 2014-02-03 | -0.028 | 0.276 |
| 2014-02-04 | -0.028 | 0.276 |
| 2014-02-05 | -0.028 | 0.276 |
| 2014-02-06 | -0.028 | 0.276 |
| 2014-02-07 | -0.028 | 0.276 |
| 2014-02-10 | -0.028 | 0.276 |
| 2014-02-11 | -0.028 | 0.276 |
| 2014-02-12 | -0.028 | 0.276 |
| 2014-02-13 | -0.028 | 0.276 |
| 2014-02-14 | -0.002 | 0.263 |
| 2014-02-17 | -0.002 | 0.263 |
| 2014-02-18 | -0.002 | 0.263 |
| 2014-02-19 | -0.002 | 0.263 |
| 2014-02-20 | -0.002 | 0.263 |
| 2014-02-21 | -0.002 | 0.263 |
| 2014-02-24 | -0.002 | 0.263 |
| 2014-02-25 | -0.002 | 0.263 |
| 2014-02-26 | -0.002 | 0.263 |
| 2014-02-27 | -0.002 | 0.263 |
| 2014-02-28 | -0.002 | 0.263 |
| 2014-03-03 | -0.002 | 0.263 |
| 2014-03-04 | -0.002 | 0.263 |
| 2014-03-05 | -0.002 | 0.263 |
| 2014-03-06 | -0.002 | 0.263 |
| 2014-03-07 | -0.002 | 0.263 |
| 2014-03-10 | -0.002 | 0.263 |
| 2014-03-11 | -0.002 | 0.263 |
| 2014-03-12 | -0.002 | 0.263 |
| 2014-03-13 | -0.002 | 0.263 |
| 2014-03-14 | -0.014 | 0.143 |
| 2014-03-17 | -0.014 | 0.143 |
| 2014-03-18 | -0.014 | 0.143 |
| 2014-03-19 | -0.014 | 0.143 |
| 2014-03-20 | -0.014 | 0.143 |
| 2014-03-21 | -0.014 | 0.143 |
| 2014-03-24 | -0.014 | 0.143 |
| 2014-03-25 | -0.014 | 0.143 |
| 2014-03-26 | -0.014 | 0.143 |
| 2014-03-27 | -0.014 | 0.143 |
| 2014-03-28 | -0.014 | 0.143 |
| 2014-03-31 | -0.014 | 0.143 |
| 2014-04-01 | -0.014 | 0.143 |
| 2014-04-02 | -0.014 | 0.143 |
| 2014-04-03 | -0.014 | 0.143 |
| 2014-04-04 | -0.014 | 0.143 |
| 2014-04-07 | -0.014 | 0.143 |
| 2014-04-08 | -0.014 | 0.143 |
| 2014-04-09 | -0.014 | 0.143 |
| 2014-04-10 | -0.014 | 0.143 |
| 2014-04-11 | -0.013 | 0.2 |
| 2014-04-14 | -0.013 | 0.2 |
| 2014-04-15 | -0.013 | 0.2 |
| 2014-04-16 | -0.013 | 0.2 |
| 2014-04-17 | -0.013 | 0.2 |
| 2014-04-22 | -0.013 | 0.2 |
| 2014-04-23 | -0.013 | 0.2 |
| 2014-04-24 | -0.013 | 0.2 |
| 2014-04-25 | -0.013 | 0.2 |
| 2014-04-28 | -0.013 | 0.2 |
| 2014-04-29 | -0.013 | 0.2 |
| 2014-04-30 | -0.013 | 0.2 |
| 2014-05-02 | -0.013 | 0.2 |
| 2014-05-05 | -0.013 | 0.2 |
| 2014-05-06 | -0.013 | 0.2 |
| 2014-05-07 | -0.013 | 0.2 |
| 2014-05-08 | -0.013 | 0.2 |
| 2014-05-09 | -0.013 | 0.2 |
| 2014-05-12 | -0.013 | 0.2 |
| 2014-05-13 | -0.013 | 0.2 |
| 2014-05-14 | -0.004 | 0.266 |
| 2014-05-15 | -0.004 | 0.266 |
| 2014-05-16 | -0.004 | 0.266 |
| 2014-05-19 | -0.004 | 0.266 |
| 2014-05-20 | -0.004 | 0.266 |
| 2014-05-21 | -0.004 | 0.266 |
| 2014-05-22 | -0.004 | 0.266 |
| 2014-05-23 | -0.004 | 0.266 |
| 2014-05-26 | -0.004 | 0.266 |
| 2014-05-27 | -0.004 | 0.266 |
| 2014-05-28 | -0.004 | 0.266 |
| 2014-05-29 | -0.004 | 0.266 |
| 2014-05-30 | -0.004 | 0.266 |
| 2014-06-02 | -0.004 | 0.266 |
| 2014-06-03 | -0.004 | 0.266 |
| 2014-06-04 | -0.004 | 0.266 |
| 2014-06-05 | -0.004 | 0.266 |
| 2014-06-06 | -0.004 | 0.266 |
| 2014-06-09 | -0.004 | 0.266 |
| 2014-06-10 | -0.004 | 0.266 |
| 2014-06-11 | -0.014 | 0.35 |
| 2014-06-12 | -0.014 | 0.35 |
| 2014-06-13 | -0.014 | 0.35 |
| 2014-06-16 | -0.014 | 0.35 |
| 2014-06-17 | -0.014 | 0.35 |
| 2014-06-18 | -0.014 | 0.35 |
| 2014-06-20 | -0.014 | 0.35 |
| 2014-06-23 | -0.014 | 0.35 |
| 2014-06-24 | -0.014 | 0.35 |
| 2014-06-25 | -0.014 | 0.35 |
| 2014-06-26 | -0.014 | 0.35 |
| 2014-06-27 | -0.014 | 0.35 |
| 2014-06-30 | -0.014 | 0.35 |
| 2014-07-01 | -0.014 | 0.35 |
| 2014-07-02 | -0.014 | 0.35 |
| 2014-07-03 | -0.014 | 0.35 |
| 2014-07-04 | -0.014 | 0.35 |
| 2014-07-07 | -0.014 | 0.35 |
| 2014-07-08 | -0.014 | 0.35 |
| 2014-07-09 | -0.014 | 0.35 |
| 2014-07-10 | -0.031 | 0.339 |
| 2014-07-11 | -0.031 | 0.339 |
| 2014-07-14 | -0.031 | 0.339 |
| 2014-07-15 | -0.031 | 0.339 |
| 2014-07-16 | -0.031 | 0.339 |
| 2014-07-17 | -0.031 | 0.339 |
| 2014-07-18 | -0.031 | 0.339 |
| 2014-07-21 | -0.031 | 0.339 |
| 2014-07-22 | -0.031 | 0.339 |
| 2014-07-23 | -0.031 | 0.339 |
| 2014-07-24 | -0.031 | 0.339 |
| 2014-07-25 | -0.031 | 0.339 |
| 2014-07-28 | -0.031 | 0.339 |
| 2014-07-29 | -0.031 | 0.339 |
| 2014-07-30 | -0.031 | 0.339 |
| 2014-07-31 | -0.031 | 0.339 |
| 2014-08-01 | -0.031 | 0.339 |
| 2014-08-04 | -0.031 | 0.339 |
| 2014-08-05 | -0.031 | 0.339 |
| 2014-08-06 | -0.031 | 0.339 |
| 2014-08-07 | -0.011 | 0.291 |
| 2014-08-08 | -0.011 | 0.291 |
| 2014-08-11 | -0.011 | 0.291 |
| 2014-08-12 | -0.011 | 0.291 |
| 2014-08-13 | -0.011 | 0.291 |
| 2014-08-14 | -0.011 | 0.291 |
| 2014-08-18 | -0.011 | 0.291 |
| 2014-08-19 | -0.011 | 0.291 |
| 2014-08-20 | -0.011 | 0.291 |
| 2014-08-21 | -0.011 | 0.291 |
| 2014-08-22 | -0.011 | 0.291 |
| 2014-08-25 | -0.011 | 0.291 |
| 2014-08-26 | -0.011 | 0.291 |
| 2014-08-27 | -0.011 | 0.291 |
| 2014-08-28 | -0.011 | 0.291 |
| 2014-08-29 | -0.011 | 0.291 |
| 2014-09-01 | -0.011 | 0.291 |
| 2014-09-02 | -0.011 | 0.291 |
| 2014-09-03 | -0.011 | 0.291 |
| 2014-09-04 | -0.011 | 0.291 |
| 2014-09-05 | 0.018 | 0.332 |
| 2014-09-08 | 0.018 | 0.332 |
| 2014-09-09 | 0.018 | 0.332 |
| 2014-09-10 | 0.018 | 0.332 |
| 2014-09-11 | 0.018 | 0.332 |
| 2014-09-12 | 0.018 | 0.332 |
| 2014-09-15 | 0.018 | 0.332 |
| 2014-09-16 | 0.018 | 0.332 |
| 2014-09-17 | 0.018 | 0.332 |
| 2014-09-18 | 0.018 | 0.332 |
| 2014-09-19 | 0.018 | 0.332 |
| 2014-09-22 | 0.018 | 0.332 |
| 2014-09-23 | 0.018 | 0.332 |
| 2014-09-24 | 0.018 | 0.332 |
| 2014-09-25 | 0.018 | 0.332 |
| 2014-09-26 | 0.018 | 0.332 |
| 2014-09-29 | 0.018 | 0.332 |
| 2014-09-30 | 0.018 | 0.332 |
| 2014-10-01 | 0.018 | 0.332 |
| 2014-10-02 | 0.018 | 0.332 |
| 2014-10-03 | -0.015 | 0.288 |
| 2014-10-06 | -0.015 | 0.288 |
| 2014-10-07 | -0.015 | 0.288 |
| 2014-10-08 | -0.015 | 0.288 |
| 2014-10-09 | -0.015 | 0.288 |
| 2014-10-10 | -0.015 | 0.288 |
| 2014-10-13 | -0.015 | 0.288 |
| 2014-10-14 | -0.015 | 0.288 |
| 2014-10-15 | -0.015 | 0.288 |
| 2014-10-16 | -0.015 | 0.288 |
| 2014-10-17 | -0.015 | 0.288 |
| 2014-10-20 | -0.015 | 0.288 |
| 2014-10-21 | -0.015 | 0.288 |
| 2014-10-22 | -0.015 | 0.288 |
| 2014-10-23 | -0.015 | 0.288 |
| 2014-10-24 | -0.015 | 0.288 |
| 2014-10-27 | -0.015 | 0.288 |
| 2014-10-28 | -0.015 | 0.288 |
| 2014-10-29 | -0.015 | 0.288 |
| 2014-10-30 | -0.015 | 0.288 |
| 2014-10-31 | -0.013 | 0.317 |
| 2014-11-03 | -0.013 | 0.317 |
| 2014-11-04 | -0.013 | 0.317 |
| 2014-11-05 | -0.013 | 0.317 |
| 2014-11-06 | -0.013 | 0.317 |
| 2014-11-07 | -0.013 | 0.317 |
| 2014-11-10 | -0.013 | 0.317 |
| 2014-11-12 | -0.013 | 0.317 |
| 2014-11-13 | -0.013 | 0.317 |
| 2014-11-14 | -0.013 | 0.317 |
| 2014-11-17 | -0.013 | 0.317 |
| 2014-11-18 | -0.013 | 0.317 |
| 2014-11-19 | -0.013 | 0.317 |
| 2014-11-20 | -0.013 | 0.317 |
| 2014-11-21 | -0.013 | 0.317 |
| 2014-11-24 | -0.013 | 0.317 |
| 2014-11-25 | -0.013 | 0.317 |
| 2014-11-26 | -0.013 | 0.317 |
| 2014-11-27 | -0.013 | 0.317 |
| 2014-11-28 | -0.013 | 0.317 |
| 2014-12-01 | -0.039 | 0.194 |
| 2014-12-02 | -0.039 | 0.194 |
| 2014-12-03 | -0.039 | 0.194 |
| 2014-12-04 | -0.039 | 0.194 |
| 2014-12-05 | -0.039 | 0.194 |
| 2014-12-08 | -0.039 | 0.194 |
| 2014-12-09 | -0.039 | 0.194 |
| 2014-12-10 | -0.039 | 0.194 |
| 2014-12-11 | -0.039 | 0.194 |
| 2014-12-12 | -0.039 | 0.194 |
| 2014-12-15 | -0.039 | 0.194 |
| 2014-12-16 | -0.039 | 0.194 |
| 2014-12-17 | -0.039 | 0.194 |
| 2014-12-18 | -0.039 | 0.194 |
| 2014-12-19 | -0.039 | 0.194 |
| 2014-12-22 | -0.039 | 0.194 |
| 2014-12-23 | -0.039 | 0.194 |
| 2014-12-29 | -0.039 | 0.194 |
| 2014-12-30 | -0.039 | 0.194 |
| 2015-01-02 | -0.039 | 0.194 |
| 2015-01-05 | -0.06 | 0.146 |
| 2015-01-07 | -0.06 | 0.146 |
| 2015-01-08 | -0.06 | 0.146 |
| 2015-01-09 | -0.06 | 0.146 |
| 2015-01-12 | -0.06 | 0.146 |
| 2015-01-13 | -0.06 | 0.146 |
| 2015-01-14 | -0.06 | 0.146 |
| 2015-01-15 | -0.06 | 0.146 |
| 2015-01-16 | -0.06 | 0.146 |
| 2015-01-19 | -0.06 | 0.146 |
| 2015-01-20 | -0.06 | 0.146 |
| 2015-01-21 | -0.06 | 0.146 |
| 2015-01-22 | -0.06 | 0.146 |
| 2015-01-23 | -0.06 | 0.146 |
| 2015-01-26 | -0.06 | 0.146 |
| 2015-01-27 | -0.06 | 0.146 |
| 2015-01-28 | -0.06 | 0.146 |
| 2015-01-29 | -0.06 | 0.146 |
| 2015-01-30 | -0.06 | 0.146 |
| 2015-02-02 | -0.06 | 0.146 |
| 2015-02-03 | -0.043 | 0.197 |
| 2015-02-04 | -0.043 | 0.197 |
| 2015-02-05 | -0.043 | 0.197 |
| 2015-02-06 | -0.043 | 0.197 |
| 2015-02-09 | -0.043 | 0.197 |
| 2015-02-10 | -0.043 | 0.197 |
| 2015-02-11 | -0.043 | 0.197 |
| 2015-02-12 | -0.043 | 0.197 |
| 2015-02-13 | -0.043 | 0.197 |
| 2015-02-16 | -0.043 | 0.197 |
| 2015-02-17 | -0.043 | 0.197 |
| 2015-02-18 | -0.043 | 0.197 |
| 2015-02-19 | -0.043 | 0.197 |
| 2015-02-20 | -0.043 | 0.197 |
| 2015-02-23 | -0.043 | 0.197 |
| 2015-02-24 | -0.043 | 0.197 |
| 2015-02-25 | -0.043 | 0.197 |
| 2015-02-26 | -0.043 | 0.197 |
| 2015-02-27 | -0.043 | 0.197 |
| 2015-03-02 | -0.043 | 0.197 |
| 2015-03-03 | -0.041 | 0.341 |
| 2015-03-04 | -0.041 | 0.341 |
| 2015-03-05 | -0.041 | 0.341 |
| 2015-03-06 | -0.041 | 0.341 |
| 2015-03-09 | -0.041 | 0.341 |
| 2015-03-10 | -0.041 | 0.341 |
| 2015-03-11 | -0.041 | 0.341 |
| 2015-03-12 | -0.041 | 0.341 |
| 2015-03-13 | -0.041 | 0.341 |
| 2015-03-16 | -0.041 | 0.341 |
| 2015-03-17 | -0.041 | 0.341 |
| 2015-03-18 | -0.041 | 0.341 |
| 2015-03-19 | -0.041 | 0.341 |
| 2015-03-20 | -0.041 | 0.341 |
| 2015-03-23 | -0.041 | 0.341 |
| 2015-03-24 | -0.041 | 0.341 |
| 2015-03-25 | -0.041 | 0.341 |
| 2015-03-26 | -0.041 | 0.341 |
| 2015-03-27 | -0.041 | 0.341 |
| 2015-03-30 | -0.041 | 0.341 |
| 2015-03-31 | 0.006 | 0.571 |
| 2015-04-01 | 0.006 | 0.571 |
| 2015-04-02 | 0.006 | 0.571 |
| 2015-04-07 | 0.006 | 0.571 |
| 2015-04-08 | 0.006 | 0.571 |
| 2015-04-09 | 0.006 | 0.571 |
| 2015-04-10 | 0.006 | 0.571 |
| 2015-04-13 | 0.006 | 0.571 |
| 2015-04-14 | 0.006 | 0.571 |
| 2015-04-15 | 0.006 | 0.571 |
| 2015-04-16 | 0.006 | 0.571 |
| 2015-04-17 | 0.006 | 0.571 |
| 2015-04-20 | 0.006 | 0.571 |
| 2015-04-21 | 0.006 | 0.571 |
| 2015-04-22 | 0.006 | 0.571 |
| 2015-04-23 | 0.006 | 0.571 |
| 2015-04-24 | 0.006 | 0.571 |
| 2015-04-27 | 0.006 | 0.571 |
| 2015-04-28 | 0.006 | 0.571 |
| 2015-04-29 | 0.006 | 0.571 |
| 2015-04-30 | 0.022 | 0.714 |
| 2015-05-04 | 0.022 | 0.714 |
| 2015-05-05 | 0.022 | 0.714 |
| 2015-05-06 | 0.022 | 0.714 |
| 2015-05-07 | 0.022 | 0.714 |
| 2015-05-08 | 0.022 | 0.714 |
| 2015-05-11 | 0.022 | 0.714 |
| 2015-05-12 | 0.022 | 0.714 |
| 2015-05-13 | 0.022 | 0.714 |
| 2015-05-14 | 0.022 | 0.714 |
| 2015-05-15 | 0.022 | 0.714 |
| 2015-05-18 | 0.022 | 0.714 |
| 2015-05-19 | 0.022 | 0.714 |
| 2015-05-20 | 0.022 | 0.714 |
| 2015-05-21 | 0.022 | 0.714 |
| 2015-05-22 | 0.022 | 0.714 |
| 2015-05-25 | 0.022 | 0.714 |
| 2015-05-26 | 0.022 | 0.714 |
| 2015-05-27 | 0.022 | 0.714 |
| 2015-05-28 | 0.022 | 0.714 |
| 2015-05-29 | -0.038 | 0.757 |
| 2015-06-01 | -0.038 | 0.757 |
| 2015-06-02 | -0.038 | 0.757 |
| 2015-06-03 | -0.038 | 0.757 |
| 2015-06-05 | -0.038 | 0.757 |
| 2015-06-08 | -0.038 | 0.757 |
| 2015-06-09 | -0.038 | 0.757 |
| 2015-06-10 | -0.038 | 0.757 |
| 2015-06-11 | -0.038 | 0.757 |
| 2015-06-12 | -0.038 | 0.757 |
| 2015-06-15 | -0.038 | 0.757 |
| 2015-06-16 | -0.038 | 0.757 |
| 2015-06-17 | -0.038 | 0.757 |
| 2015-06-18 | -0.038 | 0.757 |
| 2015-06-19 | -0.038 | 0.757 |
| 2015-06-22 | -0.038 | 0.757 |
| 2015-06-23 | -0.038 | 0.757 |
| 2015-06-24 | -0.038 | 0.757 |
| 2015-06-25 | -0.038 | 0.757 |
| 2015-06-26 | -0.038 | 0.757 |
| 2015-06-29 | -0.082 | 0.727 |
| 2015-06-30 | -0.082 | 0.727 |
| 2015-07-01 | -0.082 | 0.727 |
| 2015-07-02 | -0.082 | 0.727 |
| 2015-07-03 | -0.082 | 0.727 |
| 2015-07-06 | -0.082 | 0.727 |
| 2015-07-07 | -0.082 | 0.727 |
| 2015-07-08 | -0.082 | 0.727 |
| 2015-07-09 | -0.082 | 0.727 |
| 2015-07-10 | -0.082 | 0.727 |
| 2015-07-13 | -0.082 | 0.727 |
| 2015-07-14 | -0.082 | 0.727 |
| 2015-07-15 | -0.082 | 0.727 |
| 2015-07-16 | -0.082 | 0.727 |
| 2015-07-17 | -0.082 | 0.727 |
| 2015-07-20 | -0.082 | 0.727 |
| 2015-07-21 | -0.082 | 0.727 |
| 2015-07-22 | -0.082 | 0.727 |
| 2015-07-23 | -0.082 | 0.727 |
| 2015-07-24 | -0.082 | 0.727 |
| 2015-07-27 | -0.102 | 0.713 |
| 2015-07-28 | -0.102 | 0.713 |
| 2015-07-29 | -0.102 | 0.713 |
| 2015-07-30 | -0.102 | 0.713 |
| 2015-07-31 | -0.102 | 0.713 |
| 2015-08-03 | -0.102 | 0.713 |
| 2015-08-04 | -0.102 | 0.713 |
| 2015-08-05 | -0.102 | 0.713 |
| 2015-08-06 | -0.102 | 0.713 |
| 2015-08-07 | -0.102 | 0.713 |
| 2015-08-10 | -0.102 | 0.713 |
| 2015-08-11 | -0.102 | 0.713 |
| 2015-08-12 | -0.102 | 0.713 |
| 2015-08-13 | -0.102 | 0.713 |
| 2015-08-14 | -0.102 | 0.713 |
| 2015-08-17 | -0.102 | 0.713 |
| 2015-08-18 | -0.102 | 0.713 |
| 2015-08-19 | -0.102 | 0.713 |
| 2015-08-20 | -0.102 | 0.713 |
| 2015-08-21 | -0.102 | 0.713 |
| 2015-08-24 | -0.128 | 0.723 |
| 2015-08-25 | -0.128 | 0.723 |
| 2015-08-26 | -0.128 | 0.723 |
| 2015-08-27 | -0.128 | 0.723 |
| 2015-08-28 | -0.128 | 0.723 |
| 2015-08-31 | -0.128 | 0.723 |
| 2015-09-01 | -0.128 | 0.723 |
| 2015-09-02 | -0.128 | 0.723 |
| 2015-09-03 | -0.128 | 0.723 |
| 2015-09-04 | -0.128 | 0.723 |
| 2015-09-07 | -0.128 | 0.723 |
| 2015-09-08 | -0.128 | 0.723 |
| 2015-09-09 | -0.128 | 0.723 |
| 2015-09-10 | -0.128 | 0.723 |
| 2015-09-11 | -0.128 | 0.723 |
| 2015-09-14 | -0.128 | 0.723 |
| 2015-09-15 | -0.128 | 0.723 |
| 2015-09-16 | -0.128 | 0.723 |
| 2015-09-17 | -0.128 | 0.723 |
| 2015-09-18 | -0.128 | 0.723 |
| 2015-09-21 | -0.144 | 0.756 |
| 2015-09-22 | -0.144 | 0.756 |
| 2015-09-23 | -0.144 | 0.756 |
| 2015-09-24 | -0.144 | 0.756 |
| 2015-09-25 | -0.144 | 0.756 |
| 2015-09-28 | -0.144 | 0.756 |
| 2015-09-29 | -0.144 | 0.756 |
| 2015-09-30 | -0.144 | 0.756 |
| 2015-10-01 | -0.144 | 0.756 |
| 2015-10-02 | -0.144 | 0.756 |
| 2015-10-05 | -0.144 | 0.756 |
| 2015-10-06 | -0.144 | 0.756 |
| 2015-10-07 | -0.144 | 0.756 |
| 2015-10-08 | -0.144 | 0.756 |
| 2015-10-09 | -0.144 | 0.756 |
| 2015-10-12 | -0.144 | 0.756 |
| 2015-10-13 | -0.144 | 0.756 |
| 2015-10-14 | -0.144 | 0.756 |
| 2015-10-15 | -0.144 | 0.756 |
| 2015-10-16 | -0.144 | 0.756 |
| 2015-10-19 | -0.16 | 0.746 |
| 2015-10-20 | -0.16 | 0.746 |
| 2015-10-21 | -0.16 | 0.746 |
| 2015-10-22 | -0.16 | 0.746 |
| 2015-10-23 | -0.16 | 0.746 |
| 2015-10-26 | -0.16 | 0.746 |
| 2015-10-27 | -0.16 | 0.746 |
| 2015-10-28 | -0.16 | 0.746 |
| 2015-10-29 | -0.16 | 0.746 |
| 2015-10-30 | -0.16 | 0.746 |
| 2015-11-02 | -0.16 | 0.746 |
| 2015-11-03 | -0.16 | 0.746 |
| 2015-11-04 | -0.16 | 0.746 |
| 2015-11-05 | -0.16 | 0.746 |
| 2015-11-06 | -0.16 | 0.746 |
| 2015-11-09 | -0.16 | 0.746 |
| 2015-11-10 | -0.16 | 0.746 |
| 2015-11-12 | -0.16 | 0.746 |
| 2015-11-13 | -0.16 | 0.746 |
| 2015-11-16 | -0.16 | 0.746 |
| 2015-11-17 | -0.225 | 0.436 |
| 2015-11-18 | -0.225 | 0.436 |
| 2015-11-19 | -0.225 | 0.436 |
| 2015-11-20 | -0.225 | 0.436 |
| 2015-11-23 | -0.225 | 0.436 |
| 2015-11-24 | -0.225 | 0.436 |
| 2015-11-25 | -0.225 | 0.436 |
| 2015-11-26 | -0.225 | 0.436 |
| 2015-11-27 | -0.225 | 0.436 |
| 2015-11-30 | -0.225 | 0.436 |
| 2015-12-01 | -0.225 | 0.436 |
| 2015-12-02 | -0.225 | 0.436 |
| 2015-12-03 | -0.225 | 0.436 |
| 2015-12-04 | -0.225 | 0.436 |
| 2015-12-07 | -0.225 | 0.436 |
| 2015-12-08 | -0.225 | 0.436 |
| 2015-12-09 | -0.225 | 0.436 |
| 2015-12-10 | -0.225 | 0.436 |
| 2015-12-11 | -0.225 | 0.436 |
| 2015-12-14 | -0.225 | 0.436 |
| 2015-12-15 | -0.246 | 0.356 |
| 2015-12-16 | -0.246 | 0.356 |
| 2015-12-17 | -0.246 | 0.356 |
| 2015-12-18 | -0.246 | 0.356 |
| 2015-12-21 | -0.246 | 0.356 |
| 2015-12-22 | -0.246 | 0.356 |
| 2015-12-23 | -0.246 | 0.356 |
| 2015-12-28 | -0.246 | 0.356 |
| 2015-12-29 | -0.246 | 0.356 |
| 2015-12-30 | -0.246 | 0.356 |